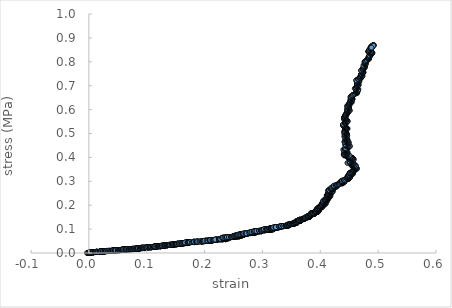
| Category | Series 0 |
|---|---|
| 0.0019377319927558773 | 0 |
| 0.00030210475268787967 | 0 |
| -6.822983028480434e-05 | 0 |
| 0.0001169546046643579 | 0 |
| -0.00012671629123928212 | 0.001 |
| -0.00018520609639395647 | 0.001 |
| 0.0019377319927558773 | 0.001 |
| 0.0013344189403491273 | 0.001 |
| 0.0001169546046643579 | 0 |
| -0.0022638152880408856 | 0 |
| -0.003114068732701402 | 0 |
| -0.00018520609639395647 | 0 |
| -6.822983028480434e-05 | 0 |
| 5.847901212951098e-05 | 0 |
| 0.00017542673968493476 | 0 |
| -6.822983028480434e-05 | 0.001 |
| 0.0001169546046643579 | 0.001 |
| 0.0 | 0.001 |
| 0.0001169546046643579 | 0.001 |
| -0.00024369932280604752 | 0.001 |
| 0.0 | 0.001 |
| 0.002005824639454027 | 0.001 |
| 0.0018209900785496095 | 0.001 |
| 0.0001169546046643579 | 0.001 |
| -0.00031194578324798323 | 0.001 |
| -6.822983028480434e-05 | 0.001 |
| 0.0016945040349432884 | 0.001 |
| 0.0013344189403491273 | 0.001 |
| 0.0001169546046643579 | 0.001 |
| 0.0012078720990073603 | 0.001 |
| 0.0021809000402655725 | 0.001 |
| 0.0003605660629025889 | 0.001 |
| 0.0006041182656574216 | 0.001 |
| 0.0022489768963809944 | 0.001 |
| 0.0022489768963809944 | 0.001 |
| 0.0022489768963809944 | 0.001 |
| 0.0025504027823414523 | 0.001 |
| 0.0021225449789728 | 0.001 |
| 0.002307324580413086 | 0.002 |
| 0.0021809000402655725 | 0.002 |
| 0.0021225449789728 | 0.002 |
| 0.002307324580413086 | 0.002 |
| 0.0017626140102958454 | 0.002 |
| 0.0022489768963809944 | 0.002 |
| 0.0022489768963809944 | 0.002 |
| 0.0020641865121681195 | 0.002 |
| 0.004910053025065919 | 0.002 |
| 0.00460933766709584 | 0.002 |
| 0.0022489768963809944 | 0.002 |
| 0.002365668860191575 | 0.002 |
| 0.0018209900785496095 | 0.002 |
| 0.0003605660629025889 | 0.002 |
| -6.822983028480434e-05 | 0.002 |
| 0.0022489768963809944 | 0.002 |
| 0.0021809000402655725 | 0.002 |
| 0.0021225449789728 | 0.002 |
| 0.0022489768963809944 | 0.002 |
| 0.0022489768963809944 | 0.002 |
| 0.002365668860191575 | 0.003 |
| 0.0020641865121681195 | 0.003 |
| 0.002307324580413086 | 0.003 |
| 0.004910053025065919 | 0.003 |
| 0.005094317553863721 | 0.003 |
| 0.005278548897983513 | 0.003 |
| 0.005394887890596973 | 0.003 |
| 0.005152499459647585 | 0.003 |
| 0.007457654401913286 | 0.003 |
| 0.007757514574202006 | 0.003 |
| 0.00812496665582125 | 0.003 |
| 0.008057288659157112 | 0.003 |
| 0.00781553869854066 | 0.003 |
| 0.005821348182831189 | 0.003 |
| 0.0055209067816348895 | 0.003 |
| 0.008182969463609826 | 0.003 |
| 0.00781553869854066 | 0.003 |
| 0.007999270956746038 | 0.003 |
| 0.008540598121874556 | 0.004 |
| 0.007641448617315353 | 0.004 |
| 0.008182969463609826 | 0.004 |
| 0.008057288659157112 | 0.004 |
| 0.007999270956746038 | 0.004 |
| 0.008240968907267818 | 0.004 |
| 0.008298972589020032 | 0.004 |
| 0.011011501947230747 | 0.004 |
| 0.010770472782698878 | 0.004 |
| 0.010895813075501927 | 0.004 |
| 0.011136812034900816 | 0.004 |
| 0.011011501947230747 | 0.004 |
| 0.011252473030703189 | 0.004 |
| 0.011194640415058243 | 0.004 |
| 0.010837967411561384 | 0.004 |
| 0.010837967411561384 | 0.004 |
| 0.011194640415058243 | 0.004 |
| 0.013716693389746756 | 0.004 |
| 0.013303200593359689 | 0.004 |
| 0.013476315452377284 | 0.005 |
| 0.013957013559449467 | 0.005 |
| 0.013783989463870397 | 0.005 |
| 0.013601317073666503 | 0.005 |
| 0.013601317073666503 | 0.005 |
| 0.013476315452377284 | 0.005 |
| 0.01389933714764287 | 0.005 |
| 0.01354362014232192 | 0.005 |
| 0.013716693389746756 | 0.005 |
| 0.015340137183956458 | 0.005 |
| 0.01672135795758085 | 0.005 |
| 0.019525875835239365 | 0.005 |
| 0.01970746175411439 | 0.005 |
| 0.02000367540098965 | 0.005 |
| 0.019592774604077292 | 0.005 |
| 0.019764804154667474 | 0.005 |
| 0.022036553078574453 | 0.005 |
| 0.022570336579391406 | 0.005 |
| 0.025368020007410248 | 0.005 |
| 0.025662561902579727 | 0.006 |
| 0.025187459155048383 | 0.006 |
| 0.022808538683586316 | 0.006 |
| 0.021855382136539078 | 0.006 |
| 0.022389262326364158 | 0.006 |
| 0.023760787588286966 | 0.006 |
| 0.025244480713663947 | 0.006 |
| 0.025301499021006757 | 0.006 |
| 0.025301499021006757 | 0.006 |
| 0.02542503874414127 | 0.006 |
| 0.02405579570850097 | 0.006 |
| 0.022389262326364158 | 0.006 |
| 0.025006858218697733 | 0.006 |
| 0.02542503874414127 | 0.006 |
| 0.02542503874414127 | 0.006 |
| 0.023637042080112084 | 0.006 |
| 0.022208162776344773 | 0.006 |
| 0.022513162328480572 | 0.006 |
| 0.02209376208266646 | 0.006 |
| 0.02227488984624007 | 0.007 |
| 0.02119717648942345 | 0.007 |
| 0.0196501235812552 | 0.007 |
| 0.02007054972720237 | 0.007 |
| 0.01994634669664423 | 0.007 |
| 0.019889022219767814 | 0.007 |
| 0.02102540069966509 | 0.007 |
| 0.022036553078574453 | 0.007 |
| 0.02482622465975711 | 0.007 |
| 0.025187459155048383 | 0.007 |
| 0.025482046757593604 | 0.007 |
| 0.025063890076096478 | 0.007 |
| 0.025368020007410248 | 0.007 |
| 0.027911492868786858 | 0.007 |
| 0.02779774281995271 | 0.007 |
| 0.02820528666646375 | 0.007 |
| 0.02779774281995271 | 0.007 |
| 0.027911492868786858 | 0.008 |
| 0.027968359314533016 | 0.008 |
| 0.028385303487669843 | 0.008 |
| 0.030864417036506997 | 0.008 |
| 0.029691862483952416 | 0.008 |
| 0.028034703140979247 | 0.008 |
| 0.028385303487669843 | 0.008 |
| 0.028271607325113992 | 0.008 |
| 0.030930576443423237 | 0.008 |
| 0.03198840590006658 | 0.008 |
| 0.03334683016256716 | 0.008 |
| 0.03329026875892624 | 0.008 |
| 0.032988539063922344 | 0.008 |
| 0.030751009839572966 | 0.008 |
| 0.030278311620742418 | 0.008 |
| 0.030751009839572966 | 0.008 |
| 0.03287536509838387 | 0.008 |
| 0.03334683016256716 | 0.008 |
| 0.03345995078612794 | 0.008 |
| 0.032516905007889806 | 0.008 |
| 0.030637582346084456 | 0.009 |
| 0.03145962733323605 | 0.009 |
| 0.030514684943199748 | 0.009 |
| 0.033167704367367545 | 0.009 |
| 0.03470341901536945 | 0.009 |
| 0.03640596169521909 | 0.009 |
| 0.036932131890693574 | 0.009 |
| 0.03581368910822687 | 0.009 |
| 0.033525931289924704 | 0.009 |
| 0.03428910138334906 | 0.009 |
| 0.03640596169521909 | 0.009 |
| 0.03863088753454702 | 0.009 |
| 0.0394463905247044 | 0.009 |
| 0.03951197723303664 | 0.009 |
| 0.03939017308039009 | 0.009 |
| 0.03933395247549706 | 0.009 |
| 0.04138406617731627 | 0.009 |
| 0.04208519144525494 | 0.01 |
| 0.04248694774368386 | 0.01 |
| 0.04272046049407468 | 0.01 |
| 0.042430900976906986 | 0.01 |
| 0.0449407111295008 | 0.01 |
| 0.04487547952082578 | 0.01 |
| 0.04517364433728862 | 0.01 |
| 0.04429753116022133 | 0.01 |
| 0.042430900976906986 | 0.01 |
| 0.042253387800404066 | 0.01 |
| 0.042318790671181425 | 0.01 |
| 0.04481956646752194 | 0.01 |
| 0.045285435058786155 | 0.01 |
| 0.04505252789234674 | 0.01 |
| 0.045108427921947136 | 0.01 |
| 0.04458654342809737 | 0.01 |
| 0.0426083826480744 | 0.01 |
| 0.04214125759073966 | 0.01 |
| 0.042318790671181425 | 0.01 |
| 0.044530614216708383 | 0.011 |
| 0.044763650287773765 | 0.011 |
| 0.04517364433728862 | 0.011 |
| 0.04522953759707535 | 0.011 |
| 0.045108427921947136 | 0.011 |
| 0.04551828799210822 | 0.011 |
| 0.0449966174098363 | 0.011 |
| 0.04755577509419372 | 0.011 |
| 0.047379169403350165 | 0.011 |
| 0.047379169403350165 | 0.011 |
| 0.047788100033174186 | 0.011 |
| 0.046970078794327685 | 0.011 |
| 0.045285435058786155 | 0.011 |
| 0.046570112633748696 | 0.011 |
| 0.05039573817080518 | 0.011 |
| 0.050571811967985915 | 0.011 |
| 0.05010839291426905 | 0.012 |
| 0.05085901682813334 | 0.012 |
| 0.05004350483422732 | 0.012 |
| 0.050571811967985915 | 0.012 |
| 0.05276547633094999 | 0.012 |
| 0.053227665960162616 | 0.012 |
| 0.05351410916723832 | 0.012 |
| 0.053338552715509586 | 0.012 |
| 0.053689627539812296 | 0.012 |
| 0.054031356438076585 | 0.012 |
| 0.05363420516048034 | 0.012 |
| 0.05628194906584206 | 0.012 |
| 0.054954339061824405 | 0.012 |
| 0.05351410916723832 | 0.012 |
| 0.05328311087482016 | 0.012 |
| 0.05356953820279097 | 0.012 |
| 0.05386512963753685 | 0.012 |
| 0.054382188163314506 | 0.013 |
| 0.05622666293095153 | 0.013 |
| 0.056512255749052845 | 0.013 |
| 0.056051589329244374 | 0.013 |
| 0.05633722489905646 | 0.013 |
| 0.05501891653352087 | 0.013 |
| 0.053458669792962536 | 0.013 |
| 0.05582116926578267 | 0.013 |
| 0.05617138098582543 | 0.013 |
| 0.056456982345814415 | 0.013 |
| 0.05714762971857091 | 0.013 |
| 0.05869294155782194 | 0.013 |
| 0.05708318957200422 | 0.013 |
| 0.055996290456835185 | 0.013 |
| 0.056392497677022 | 0.013 |
| 0.05697271005302187 | 0.013 |
| 0.0588675606059613 | 0.013 |
| 0.058987015427307235 | 0.013 |
| 0.05881241723883024 | 0.013 |
| 0.05892269370588938 | 0.014 |
| 0.05996052060226892 | 0.014 |
| 0.061107307335857154 | 0.014 |
| 0.061446496788218424 | 0.014 |
| 0.06116231709318077 | 0.014 |
| 0.06156565116593823 | 0.014 |
| 0.06202378501319317 | 0.014 |
| 0.0642473382642795 | 0.014 |
| 0.06619232732469377 | 0.014 |
| 0.06635651775994131 | 0.014 |
| 0.06442099736851706 | 0.014 |
| 0.06401881354283481 | 0.014 |
| 0.06413765464082301 | 0.014 |
| 0.06431132560426765 | 0.014 |
| 0.06442099736851706 | 0.014 |
| 0.06442099736851706 | 0.015 |
| 0.06431132560426765 | 0.015 |
| 0.0642473382642795 | 0.015 |
| 0.06271059248688822 | 0.015 |
| 0.061043121855155404 | 0.015 |
| 0.05909727264303708 | 0.015 |
| 0.05927181388364185 | 0.015 |
| 0.06121732382459744 | 0.015 |
| 0.06350670786147739 | 0.015 |
| 0.06413765464082301 | 0.015 |
| 0.0642473382642795 | 0.015 |
| 0.06413765464082301 | 0.015 |
| 0.0642473382642795 | 0.015 |
| 0.06612846741040886 | 0.015 |
| 0.06698566958527677 | 0.015 |
| 0.06982560351857135 | 0.015 |
| 0.06999828953954827 | 0.015 |
| 0.06959834301434895 | 0.016 |
| 0.07011642219219194 | 0.016 |
| 0.06966198173370715 | 0.016 |
| 0.0721588596145381 | 0.016 |
| 0.0726121741912435 | 0.016 |
| 0.07232207339870096 | 0.016 |
| 0.07254871581885226 | 0.016 |
| 0.07232207339870096 | 0.016 |
| 0.07486660878125173 | 0.016 |
| 0.07611382138189929 | 0.016 |
| 0.07774740693946013 | 0.016 |
| 0.07785562217044084 | 0.016 |
| 0.07746780853513706 | 0.016 |
| 0.07549044506316407 | 0.016 |
| 0.0750384265561237 | 0.016 |
| 0.07515596533685696 | 0.016 |
| 0.07689936288655297 | 0.017 |
| 0.07746780853513706 | 0.017 |
| 0.07531870494222404 | 0.017 |
| 0.07436001546314766 | 0.017 |
| 0.07221327192328611 | 0.017 |
| 0.072439939001014 | 0.017 |
| 0.07249432888898265 | 0.017 |
| 0.0749841677577847 | 0.017 |
| 0.07611382138189929 | 0.017 |
| 0.07763017237711584 | 0.017 |
| 0.07611382138189929 | 0.017 |
| 0.0750384265561237 | 0.017 |
| 0.07521021481471923 | 0.017 |
| 0.07583383684635597 | 0.017 |
| 0.07780151601876761 | 0.017 |
| 0.07909911471521187 | 0.017 |
| 0.07949528726171359 | 0.018 |
| 0.07797283030680513 | 0.018 |
| 0.07830629845301866 | 0.018 |
| 0.07972031700442445 | 0.018 |
| 0.0822461063057975 | 0.018 |
| 0.0825782233033967 | 0.018 |
| 0.08504309774693167 | 0.018 |
| 0.08454163491352554 | 0.018 |
| 0.0826948792496813 | 0.018 |
| 0.08448788931930418 | 0.018 |
| 0.0854369228975285 | 0.018 |
| 0.0878322878421698 | 0.018 |
| 0.08789476970753085 | 0.018 |
| 0.08805544951895665 | 0.019 |
| 0.08666210295952233 | 0.019 |
| 0.08504309774693167 | 0.019 |
| 0.08330489589396727 | 0.019 |
| 0.08352907008819703 | 0.019 |
| 0.08532058640736644 | 0.019 |
| 0.08549061751094068 | 0.019 |
| 0.08521317603474327 | 0.019 |
| 0.08336766127164633 | 0.019 |
| 0.08291919022027855 | 0.019 |
| 0.08274872129414235 | 0.019 |
| 0.0843176876207227 | 0.019 |
| 0.08504309774693167 | 0.019 |
| 0.08537428726761694 | 0.019 |
| 0.08476553206516718 | 0.019 |
| 0.0829730201890576 | 0.019 |
| 0.08291919022027855 | 0.019 |
| 0.08247051795238348 | 0.019 |
| 0.0830268472603275 | 0.019 |
| 0.08336766127164633 | 0.02 |
| 0.08537428726761694 | 0.02 |
| 0.08521317603474327 | 0.02 |
| 0.08515946652175141 | 0.02 |
| 0.08767157216628463 | 0.02 |
| 0.08834101539416819 | 0.02 |
| 0.09062261141455928 | 0.02 |
| 0.09217928195448871 | 0.02 |
| 0.0929523090437248 | 0.02 |
| 0.09556010327657845 | 0.02 |
| 0.09549809853939678 | 0.02 |
| 0.0956664080704955 | 0.02 |
| 0.09738327370013465 | 0.021 |
| 0.09809927093652604 | 0.021 |
| 0.09837316069809626 | 0.021 |
| 0.09782530613880241 | 0.021 |
| 0.09571955622998808 | 0.021 |
| 0.09478023577688645 | 0.021 |
| 0.09289901360252929 | 0.021 |
| 0.09334303223961135 | 0.021 |
| 0.09267693032989066 | 0.021 |
| 0.09312104756513888 | 0.021 |
| 0.09334303223961135 | 0.021 |
| 0.09278354204481659 | 0.021 |
| 0.09117435518344211 | 0.021 |
| 0.09122774261792112 | 0.021 |
| 0.09312104756513888 | 0.021 |
| 0.09201038443265848 | 0.021 |
| 0.09050687668249648 | 0.021 |
| 0.09089855634744624 | 0.022 |
| 0.09089855634744624 | 0.022 |
| 0.09089855634744624 | 0.022 |
| 0.09178810370068922 | 0.022 |
| 0.09284571532077876 | 0.022 |
| 0.09322761194499961 | 0.022 |
| 0.09367148473463378 | 0.022 |
| 0.09561325708612553 | 0.022 |
| 0.09583468927826279 | 0.022 |
| 0.09561325708612553 | 0.022 |
| 0.09798439833640239 | 0.022 |
| 0.09793137041607795 | 0.022 |
| 0.09832015338957115 | 0.022 |
| 0.09959141516815744 | 0.023 |
| 0.10019121429817732 | 0.023 |
| 0.10052622934266806 | 0.023 |
| 0.10030583368963647 | 0.023 |
| 0.10035873584980763 | 0.023 |
| 0.10047333604275678 | 0.023 |
| 0.10030583368963647 | 0.023 |
| 0.10047333604275678 | 0.023 |
| 0.10057911984502611 | 0.023 |
| 0.10041163521148848 | 0.023 |
| 0.1023403763041828 | 0.023 |
| 0.10288576351044133 | 0.023 |
| 0.10332537088273527 | 0.023 |
| 0.10250753824152231 | 0.023 |
| 0.10052622934266806 | 0.023 |
| 0.10079945528184055 | 0.024 |
| 0.10030583368963647 | 0.024 |
| 0.10272744923552674 | 0.024 |
| 0.10338689220127394 | 0.024 |
| 0.10563445483090304 | 0.024 |
| 0.10601149949068259 | 0.024 |
| 0.10563445483090304 | 0.024 |
| 0.10601149949068259 | 0.024 |
| 0.10623057243112885 | 0.024 |
| 0.10826191344482194 | 0.024 |
| 0.10858550295417088 | 0.024 |
| 0.1084193540239672 | 0.024 |
| 0.10858550295417088 | 0.025 |
| 0.10853303423381971 | 0.025 |
| 0.10848056276035747 | 0.025 |
| 0.10869916427882023 | 0.025 |
| 0.10804321631130767 | 0.025 |
| 0.10639708539302435 | 0.025 |
| 0.10601149949068259 | 0.025 |
| 0.10836687658504127 | 0.025 |
| 0.10820069132331059 | 0.025 |
| 0.10820069132331059 | 0.025 |
| 0.11071671891205473 | 0.025 |
| 0.11109185255095075 | 0.025 |
| 0.11098717505836816 | 0.025 |
| 0.11103951517433164 | 0.025 |
| 0.11082142471765502 | 0.026 |
| 0.11348751995783123 | 0.026 |
| 0.11430504049626661 | 0.026 |
| 0.11636339011382153 | 0.026 |
| 0.11479180159207329 | 0.026 |
| 0.11360062550756497 | 0.026 |
| 0.11375715945228408 | 0.026 |
| 0.11360062550756497 | 0.026 |
| 0.11375715945228408 | 0.026 |
| 0.115278325866786 | 0.026 |
| 0.11599029742810553 | 0.026 |
| 0.11425287102396335 | 0.026 |
| 0.11387023451012987 | 0.026 |
| 0.11387023451012987 | 0.026 |
| 0.11403548032083023 | 0.027 |
| 0.11375715945228408 | 0.027 |
| 0.11604237634084338 | 0.027 |
| 0.11592954664534023 | 0.027 |
| 0.11636339011382153 | 0.027 |
| 0.11484394295696063 | 0.027 |
| 0.11360062550756497 | 0.027 |
| 0.11408766113522865 | 0.027 |
| 0.11392242394767652 | 0.027 |
| 0.11620726363331384 | 0.027 |
| 0.11473965750832185 | 0.027 |
| 0.11365282901738366 | 0.027 |
| 0.11392242394767652 | 0.027 |
| 0.1139746106616283 | 0.027 |
| 0.1139746106616283 | 0.027 |
| 0.11625933124820724 | 0.028 |
| 0.11874647689457955 | 0.028 |
| 0.1190753339769507 | 0.028 |
| 0.1190753339769507 | 0.028 |
| 0.11912725247607817 | 0.028 |
| 0.12042427172403097 | 0.028 |
| 0.12160735210311821 | 0.028 |
| 0.12387465235024431 | 0.028 |
| 0.12402965412894439 | 0.028 |
| 0.12424488324502757 | 0.029 |
| 0.12419322977373506 | 0.029 |
| 0.12397798953883743 | 0.029 |
| 0.12241833188918609 | 0.029 |
| 0.12193526986493432 | 0.029 |
| 0.12419322977373506 | 0.029 |
| 0.124460066047506 | 0.029 |
| 0.12408991482621805 | 0.029 |
| 0.12225446563271382 | 0.029 |
| 0.12155556221083083 | 0.029 |
| 0.12171954302462851 | 0.029 |
| 0.12322865451994444 | 0.029 |
| 0.12419322977373506 | 0.029 |
| 0.12424488324502757 | 0.029 |
| 0.12457193739435579 | 0.029 |
| 0.126557752182563 | 0.03 |
| 0.12532033451973204 | 0.03 |
| 0.12419322977373506 | 0.03 |
| 0.12607675367445065 | 0.03 |
| 0.12639456289066067 | 0.03 |
| 0.126557752182563 | 0.03 |
| 0.1274162187464833 | 0.03 |
| 0.1291308767719235 | 0.03 |
| 0.1291308767719235 | 0.03 |
| 0.12929362017336138 | 0.03 |
| 0.12923367224990234 | 0.03 |
| 0.12837676516015553 | 0.03 |
| 0.12634302034137979 | 0.03 |
| 0.1267724379238817 | 0.031 |
| 0.1264461027834443 | 0.031 |
| 0.12923367224990234 | 0.031 |
| 0.13003849324694222 | 0.031 |
| 0.1314837664709281 | 0.031 |
| 0.1316375933896048 | 0.031 |
| 0.13110766787798028 | 0.031 |
| 0.12934501086925201 | 0.031 |
| 0.13008984567852327 | 0.031 |
| 0.1314837664709281 | 0.031 |
| 0.1336691265083911 | 0.031 |
| 0.1336691265083911 | 0.032 |
| 0.13158632037919216 | 0.032 |
| 0.1317486646959858 | 0.032 |
| 0.13115896543559244 | 0.032 |
| 0.12977314155274836 | 0.032 |
| 0.1291822758317768 | 0.032 |
| 0.13137266573642312 | 0.032 |
| 0.13179992938340535 | 0.032 |
| 0.1313213791402243 | 0.032 |
| 0.1316375933896048 | 0.032 |
| 0.13142394970244187 | 0.032 |
| 0.1316375933896048 | 0.032 |
| 0.1323892509002585 | 0.032 |
| 0.1338822911168324 | 0.033 |
| 0.13595182832090666 | 0.033 |
| 0.136011374866619 | 0.033 |
| 0.1361645069447402 | 0.033 |
| 0.136011374866619 | 0.033 |
| 0.1360624214981963 | 0.033 |
| 0.13611346552414824 | 0.033 |
| 0.1360624214981963 | 0.033 |
| 0.13611346552414824 | 0.033 |
| 0.1371762349040561 | 0.033 |
| 0.1385009246027981 | 0.033 |
| 0.13887425337288947 | 0.033 |
| 0.13892515407686787 | 0.034 |
| 0.1412043558619829 | 0.034 |
| 0.14062020795728924 | 0.034 |
| 0.1386112362419656 | 0.034 |
| 0.13892515407686787 | 0.034 |
| 0.13871306183616355 | 0.034 |
| 0.1412043558619829 | 0.034 |
| 0.14205034571718417 | 0.034 |
| 0.1438920681760256 | 0.034 |
| 0.14210108501638177 | 0.034 |
| 0.14094201752996943 | 0.034 |
| 0.13876397074535726 | 0.034 |
| 0.14019676374290063 | 0.035 |
| 0.14109432991924575 | 0.035 |
| 0.14357970592117253 | 0.035 |
| 0.14384141967103 | 0.035 |
| 0.14395114379396204 | 0.035 |
| 0.14468518247565168 | 0.035 |
| 0.14594942706047345 | 0.035 |
| 0.1446345741258004 | 0.035 |
| 0.14384141967103 | 0.035 |
| 0.1459999689131953 | 0.035 |
| 0.1471616608850204 | 0.035 |
| 0.14852361190313013 | 0.036 |
| 0.14721214150786538 | 0.036 |
| 0.14621052143684315 | 0.036 |
| 0.1462610500954278 | 0.036 |
| 0.14742243898695936 | 0.036 |
| 0.14863282350547505 | 0.036 |
| 0.14700179979443914 | 0.036 |
| 0.1459999689131953 | 0.036 |
| 0.14610945645959314 | 0.036 |
| 0.14721214150786538 | 0.036 |
| 0.14863282350547505 | 0.036 |
| 0.15041215692078053 | 0.036 |
| 0.15088166004498124 | 0.037 |
| 0.1511414699805148 | 0.037 |
| 0.15135094283943978 | 0.037 |
| 0.15083136432691274 | 0.037 |
| 0.15109118732840474 | 0.037 |
| 0.15088166004498124 | 0.037 |
| 0.1532843358898512 | 0.037 |
| 0.15349336040398018 | 0.037 |
| 0.1531338032892465 | 0.037 |
| 0.1519790982715526 | 0.037 |
| 0.15078106607905759 | 0.037 |
| 0.1511414699805148 | 0.037 |
| 0.15140957947186903 | 0.038 |
| 0.15318398334060837 | 0.038 |
| 0.15171950589729008 | 0.038 |
| 0.15078106607905759 | 0.038 |
| 0.1510409021478222 | 0.038 |
| 0.1512001188966534 | 0.038 |
| 0.15083136432691274 | 0.038 |
| 0.1526570000720541 | 0.038 |
| 0.15302508216818708 | 0.038 |
| 0.15334285926745858 | 0.038 |
| 0.153551871550403 | 0.038 |
| 0.15307526767534008 | 0.038 |
| 0.15360203062798894 | 0.039 |
| 0.15318398334060837 | 0.039 |
| 0.15578968545583508 | 0.039 |
| 0.15578968545583508 | 0.039 |
| 0.15578968545583508 | 0.039 |
| 0.15589810643749363 | 0.039 |
| 0.15589810643749363 | 0.039 |
| 0.15844684095732497 | 0.039 |
| 0.15953601269302561 | 0.039 |
| 0.1608314302795973 | 0.04 |
| 0.16098909594062386 | 0.04 |
| 0.16052431548488696 | 0.04 |
| 0.15875459434012745 | 0.04 |
| 0.15902067070116574 | 0.04 |
| 0.16078163252341665 | 0.04 |
| 0.16326829222429048 | 0.04 |
| 0.16357456558714797 | 0.04 |
| 0.16119651632568885 | 0.04 |
| 0.1599015065731444 | 0.04 |
| 0.15844684095732497 | 0.04 |
| 0.16036657652112962 | 0.04 |
| 0.16103888336692077 | 0.04 |
| 0.1637814504411716 | 0.041 |
| 0.16398829250270539 | 0.041 |
| 0.1637814504411716 | 0.041 |
| 0.16393865170719982 | 0.041 |
| 0.16388900844736337 | 0.041 |
| 0.16616161232919482 | 0.041 |
| 0.16719293868834498 | 0.041 |
| 0.1686267221123183 | 0.042 |
| 0.1705352411275244 | 0.042 |
| 0.17047771533510847 | 0.042 |
| 0.168939580612054 | 0.042 |
| 0.16878316359724121 | 0.042 |
| 0.1686267221123183 | 0.042 |
| 0.17022288152357923 | 0.042 |
| 0.1706831770962728 | 0.042 |
| 0.17104468471294967 | 0.042 |
| 0.16955672292371138 | 0.042 |
| 0.16616161232919482 | 0.042 |
| 0.1680666085980942 | 0.042 |
| 0.1686267221123183 | 0.043 |
| 0.1706831770962728 | 0.043 |
| 0.17104468471294967 | 0.043 |
| 0.1708392972219797 | 0.043 |
| 0.1708392972219797 | 0.043 |
| 0.17063386753832216 | 0.043 |
| 0.17088859665157313 | 0.043 |
| 0.1720709253489193 | 0.043 |
| 0.17330110288913664 | 0.043 |
| 0.17360431929571843 | 0.043 |
| 0.17314536665803823 | 0.043 |
| 0.1691947416202279 | 0.043 |
| 0.1688901850010091 | 0.044 |
| 0.1686267221123183 | 0.044 |
| 0.1705845555488195 | 0.044 |
| 0.17063386753832216 | 0.044 |
| 0.17099539297799737 | 0.044 |
| 0.17047771533510847 | 0.044 |
| 0.16857731104463727 | 0.044 |
| 0.16724235335797516 | 0.044 |
| 0.16636796270930118 | 0.044 |
| 0.1705845555488195 | 0.044 |
| 0.17140606168909558 | 0.044 |
| 0.17339945690321013 | 0.045 |
| 0.1735059854296106 | 0.045 |
| 0.17309617836320484 | 0.045 |
| 0.1734568148702377 | 0.045 |
| 0.17478344336192883 | 0.045 |
| 0.17814952085578573 | 0.045 |
| 0.18191873409071044 | 0.045 |
| 0.182828416412326 | 0.046 |
| 0.18338842833439506 | 0.046 |
| 0.183128694305684 | 0.046 |
| 0.18303135643881854 | 0.046 |
| 0.18434535198612445 | 0.046 |
| 0.18515557182367395 | 0.046 |
| 0.18566570848430464 | 0.046 |
| 0.18490451528746246 | 0.046 |
| 0.18298265203499567 | 0.046 |
| 0.18323419147074504 | 0.046 |
| 0.182828416412326 | 0.047 |
| 0.18100010047896534 | 0.046 |
| 0.18247114446049428 | 0.047 |
| 0.18521232314313338 | 0.047 |
| 0.18232494224481346 | 0.047 |
| 0.18084555874925642 | 0.047 |
| 0.18110582243192677 | 0.047 |
| 0.1819674903383332 | 0.047 |
| 0.18521232314313338 | 0.047 |
| 0.1868792852689518 | 0.047 |
| 0.18778446827533601 | 0.048 |
| 0.1879378779290555 | 0.048 |
| 0.1879378779290555 | 0.048 |
| 0.18778446827533601 | 0.048 |
| 0.1912600395232701 | 0.048 |
| 0.19282050617062158 | 0.048 |
| 0.19542929244860807 | 0.048 |
| 0.1952769647889963 | 0.049 |
| 0.1952769647889963 | 0.049 |
| 0.1952769647889963 | 0.049 |
| 0.19512461392213368 | 0.049 |
| 0.19752742487976224 | 0.049 |
| 0.19792734314024094 | 0.049 |
| 0.1975754260328057 | 0.049 |
| 0.1993257989083984 | 0.049 |
| 0.1997249359814914 | 0.049 |
| 0.19812724231098572 | 0.049 |
| 0.19837506431394422 | 0.05 |
| 0.20181408430172218 | 0.05 |
| 0.20514610895987434 | 0.05 |
| 0.20593971868361477 | 0.05 |
| 0.2024591040858002 | 0.05 |
| 0.20276155646234142 | 0.05 |
| 0.20643138323933805 | 0.051 |
| 0.20638380531574751 | 0.051 |
| 0.2060824466799784 | 0.051 |
| 0.20667715606643028 | 0.051 |
| 0.20559061049237776 | 0.051 |
| 0.20161492084396834 | 0.051 |
| 0.20201320810129142 | 0.051 |
| 0.20191762861488138 | 0.051 |
| 0.20395451221749641 | 0.051 |
| 0.20404989722703312 | 0.051 |
| 0.2041532103050326 | 0.051 |
| 0.2016627261976194 | 0.051 |
| 0.2000202463452561 | 0.051 |
| 0.20370813176914235 | 0.052 |
| 0.2056382261686033 | 0.052 |
| 0.2112721066418245 | 0.052 |
| 0.21319553657057772 | 0.052 |
| 0.21354200034772633 | 0.052 |
| 0.21186373859391827 | 0.052 |
| 0.21078275484379946 | 0.053 |
| 0.2087597462296859 | 0.052 |
| 0.21157190561372188 | 0.053 |
| 0.2133924071221381 | 0.053 |
| 0.2117217714016219 | 0.053 |
| 0.21073544559165291 | 0.053 |
| 0.2089574919109106 | 0.053 |
| 0.21034061786691044 | 0.053 |
| 0.21122475847870253 | 0.053 |
| 0.21334515924736258 | 0.054 |
| 0.21398278633550444 | 0.054 |
| 0.21358923892331313 | 0.054 |
| 0.21122475847870253 | 0.054 |
| 0.2088072112478054 | 0.054 |
| 0.20909985205513687 | 0.054 |
| 0.20940030287663844 | 0.054 |
| 0.2112721066418245 | 0.054 |
| 0.21161923734330623 | 0.054 |
| 0.2111300554263822 | 0.054 |
| 0.20920264474863823 | 0.054 |
| 0.2098429178476005 | 0.054 |
| 0.21354200034772633 | 0.055 |
| 0.21525676029452734 | 0.055 |
| 0.21634076213379225 | 0.055 |
| 0.21991424336674587 | 0.055 |
| 0.22083692252457066 | 0.055 |
| 0.22050078587731084 | 0.055 |
| 0.22118074938105622 | 0.056 |
| 0.22030530993042166 | 0.056 |
| 0.21878718049485085 | 0.056 |
| 0.21937438425421305 | 0.056 |
| 0.22303065210061607 | 0.056 |
| 0.22050078587731084 | 0.056 |
| 0.2184973613168887 | 0.056 |
| 0.22488491330635013 | 0.057 |
| 0.22595076790107751 | 0.057 |
| 0.22745806910654467 | 0.057 |
| 0.2301175513262317 | 0.057 |
| 0.2318118668501338 | 0.057 |
| 0.2306516432251965 | 0.057 |
| 0.23099211259486838 | 0.057 |
| 0.2362468410448931 | 0.058 |
| 0.23620066077229238 | 0.058 |
| 0.23629301918497456 | 0.058 |
| 0.23859903042924444 | 0.058 |
| 0.2362468410448931 | 0.058 |
| 0.22760557308731333 | 0.058 |
| 0.23026466357277547 | 0.058 |
| 0.231765481309623 | 0.058 |
| 0.2303653036480002 | 0.058 |
| 0.2303653036480002 | 0.058 |
| 0.23195873007144 | 0.059 |
| 0.22900961748371243 | 0.059 |
| 0.22532072882943738 | 0.058 |
| 0.22561634610364104 | 0.059 |
| 0.22633942022425152 | 0.059 |
| 0.23002462076581592 | 0.059 |
| 0.23094568901314058 | 0.059 |
| 0.23166498205685349 | 0.059 |
| 0.22668136069235637 | 0.059 |
| 0.2272639485527971 | 0.059 |
| 0.23441354780095375 | 0.06 |
| 0.23556935692729333 | 0.06 |
| 0.23620066077229238 | 0.06 |
| 0.2364853950673449 | 0.06 |
| 0.23556935692729333 | 0.06 |
| 0.23205148107602538 | 0.06 |
| 0.2330710533170287 | 0.06 |
| 0.23446751084052908 | 0.061 |
| 0.23479892555427165 | 0.061 |
| 0.23533058425403663 | 0.061 |
| 0.23859903042924444 | 0.061 |
| 0.2363391951927342 | 0.061 |
| 0.23446751084052908 | 0.061 |
| 0.23620066077229238 | 0.061 |
| 0.2367777307089771 | 0.061 |
| 0.23855295865623716 | 0.061 |
| 0.24128268312351195 | 0.062 |
| 0.242950567294762 | 0.062 |
| 0.2377310390805157 | 0.062 |
| 0.2364853950673449 | 0.062 |
| 0.2363391951927342 | 0.062 |
| 0.23658541106212175 | 0.062 |
| 0.23620066077229238 | 0.062 |
| 0.2384531392640362 | 0.062 |
| 0.23759269735756475 | 0.062 |
| 0.23210557172710775 | 0.062 |
| 0.23479892555427165 | 0.062 |
| 0.2362468410448931 | 0.063 |
| 0.23667773394835318 | 0.063 |
| 0.23667773394835318 | 0.063 |
| 0.23849921563602358 | 0.063 |
| 0.23883702405356352 | 0.063 |
| 0.2384531392640362 | 0.063 |
| 0.23893680513588342 | 0.063 |
| 0.23864510007974138 | 0.064 |
| 0.23859903042924444 | 0.064 |
| 0.23874490031332543 | 0.064 |
| 0.23849921563602358 | 0.064 |
| 0.23316370121464947 | 0.064 |
| 0.23297068519423664 | 0.064 |
| 0.23629301918497456 | 0.064 |
| 0.23682388434063337 | 0.064 |
| 0.23620066077229238 | 0.064 |
| 0.235091815147928 | 0.064 |
| 0.23369622977523152 | 0.064 |
| 0.2301175513262317 | 0.064 |
| 0.231912351342917 | 0.064 |
| 0.23446751084052908 | 0.065 |
| 0.2397960314802372 | 0.065 |
| 0.24113718298308487 | 0.065 |
| 0.24109122800167274 | 0.065 |
| 0.2384531392640362 | 0.065 |
| 0.23643922581017435 | 0.065 |
| 0.240371030957225 | 0.066 |
| 0.24152003898753893 | 0.066 |
| 0.24324101930613146 | 0.066 |
| 0.24572168923868132 | 0.066 |
| 0.2476713600708034 | 0.066 |
| 0.24070820775770202 | 0.066 |
| 0.2384531392640362 | 0.066 |
| 0.23869116760792305 | 0.066 |
| 0.24204807709751888 | 0.066 |
| 0.2456225829013674 | 0.067 |
| 0.2512712893941463 | 0.067 |
| 0.2511348083550949 | 0.067 |
| 0.2458588510739754 | 0.067 |
| 0.24805172305581738 | 0.067 |
| 0.2499513111633467 | 0.068 |
| 0.25027763467233577 | 0.068 |
| 0.251225797784106 | 0.068 |
| 0.2584475959644711 | 0.069 |
| 0.25482052200660193 | 0.069 |
| 0.2501410776296865 | 0.068 |
| 0.25027763467233577 | 0.068 |
| 0.24999686078747632 | 0.069 |
| 0.24805172305581738 | 0.068 |
| 0.2513243503874723 | 0.069 |
| 0.2540194807885404 | 0.069 |
| 0.2542991870933953 | 0.069 |
| 0.25453341436748944 | 0.069 |
| 0.25628502064945696 | 0.07 |
| 0.25764939683546406 | 0.07 |
| 0.2585379224640487 | 0.07 |
| 0.2605153647109982 | 0.07 |
| 0.2604702917005408 | 0.07 |
| 0.2564207413222846 | 0.07 |
| 0.25802598412749356 | 0.07 |
| 0.2607481997300115 | 0.071 |
| 0.2592450993325793 | 0.071 |
| 0.25816152794842906 | 0.071 |
| 0.2562322222293632 | 0.071 |
| 0.2537321430391783 | 0.071 |
| 0.2500423486429429 | 0.07 |
| 0.25033080809154695 | 0.071 |
| 0.25023215751851025 | 0.071 |
| 0.25023215751851025 | 0.071 |
| 0.2526500800948117 | 0.071 |
| 0.25599833323158755 | 0.071 |
| 0.25335393495812525 | 0.071 |
| 0.25278635449868586 | 0.072 |
| 0.2584024296549196 | 0.072 |
| 0.2585379224640487 | 0.072 |
| 0.2585905992902523 | 0.072 |
| 0.2643987152255002 | 0.073 |
| 0.2641218199943237 | 0.073 |
| 0.25877873352443514 | 0.073 |
| 0.2607481997300115 | 0.073 |
| 0.2629011549508411 | 0.073 |
| 0.26173145069094045 | 0.073 |
| 0.2607031372131442 | 0.073 |
| 0.26089081541349624 | 0.073 |
| 0.257739795459097 | 0.073 |
| 0.2521730627341263 | 0.073 |
| 0.2588238828413107 | 0.073 |
| 0.26028247546721306 | 0.074 |
| 0.2566621220019592 | 0.074 |
| 0.2571294757398796 | 0.074 |
| 0.2584475959644711 | 0.074 |
| 0.2552434871864685 | 0.074 |
| 0.25416311870803265 | 0.074 |
| 0.2561416872142317 | 0.074 |
| 0.2569862633008757 | 0.074 |
| 0.2584927602341194 | 0.075 |
| 0.26379244730326495 | 0.075 |
| 0.2643538169138426 | 0.075 |
| 0.25660934348899295 | 0.075 |
| 0.25868085369380384 | 0.075 |
| 0.2629011549508411 | 0.075 |
| 0.26622271749206405 | 0.076 |
| 0.26757361117868594 | 0.076 |
| 0.26752885519163416 | 0.076 |
| 0.26510181985273 | 0.076 |
| 0.26079326021633986 | 0.076 |
| 0.2644510842347328 | 0.076 |
| 0.26468300478739243 | 0.076 |
| 0.25905705282556274 | 0.076 |
| 0.26201649943225264 | 0.076 |
| 0.2673871831284327 | 0.077 |
| 0.2629985636640598 | 0.077 |
| 0.2607031372131442 | 0.077 |
| 0.2607481997300115 | 0.077 |
| 0.2611686066168469 | 0.077 |
| 0.2607481997300115 | 0.077 |
| 0.2627662520802612 | 0.077 |
| 0.2623389690379522 | 0.077 |
| 0.25872600743000357 | 0.077 |
| 0.26107857647498983 | 0.078 |
| 0.2652886744061719 | 0.078 |
| 0.2656623963394228 | 0.078 |
| 0.2654755528313076 | 0.078 |
| 0.2696226145127204 | 0.079 |
| 0.2671558889555394 | 0.079 |
| 0.2629536024425166 | 0.078 |
| 0.267856999709775 | 0.079 |
| 0.2698086848456773 | 0.079 |
| 0.26995007280634165 | 0.079 |
| 0.2714817616782793 | 0.08 |
| 0.2738934388464477 | 0.08 |
| 0.2677600631256651 | 0.08 |
| 0.2656623963394228 | 0.08 |
| 0.26748409720139404 | 0.08 |
| 0.26748409720139404 | 0.08 |
| 0.2673871831284327 | 0.08 |
| 0.2691535683449964 | 0.08 |
| 0.2692057475057583 | 0.08 |
| 0.2655652467740056 | 0.08 |
| 0.26705888438101977 | 0.08 |
| 0.2696226145127204 | 0.081 |
| 0.26831921047133345 | 0.081 |
| 0.2679464803147961 | 0.081 |
| 0.27393791089115593 | 0.081 |
| 0.27180113550033846 | 0.081 |
| 0.26743188679155344 | 0.081 |
| 0.2707385175319771 | 0.082 |
| 0.27217243194235397 | 0.082 |
| 0.274167583637642 | 0.082 |
| 0.275692831112027 | 0.082 |
| 0.2786477283244208 | 0.083 |
| 0.27449355726241664 | 0.083 |
| 0.2726845924079209 | 0.083 |
| 0.2804901294386682 | 0.083 |
| 0.28141008756688984 | 0.083 |
| 0.2810422058681244 | 0.084 |
| 0.28585797379923 | 0.084 |
| 0.2865900115534814 | 0.084 |
| 0.2794293478334794 | 0.084 |
| 0.281226163634625 | 0.084 |
| 0.28503006519593554 | 0.085 |
| 0.2823732986252729 | 0.084 |
| 0.28159397767736244 | 0.084 |
| 0.28868810080549806 | 0.085 |
| 0.286538789227627 | 0.085 |
| 0.28099804865326944 | 0.085 |
| 0.28127031077792863 | 0.085 |
| 0.2807625298667794 | 0.085 |
| 0.2770310005827727 | 0.085 |
| 0.27993780598828577 | 0.085 |
| 0.2848907935162664 | 0.086 |
| 0.2807625298667794 | 0.086 |
| 0.2795251598653008 | 0.086 |
| 0.28695585833922665 | 0.086 |
| 0.28608498297392093 | 0.086 |
| 0.2832914689994513 | 0.086 |
| 0.28622408844764624 | 0.087 |
| 0.2868168546285358 | 0.087 |
| 0.28154249879609927 | 0.086 |
| 0.28301242144376787 | 0.087 |
| 0.2870875373267556 | 0.087 |
| 0.284619515463162 | 0.087 |
| 0.28365852431704164 | 0.087 |
| 0.2889582775317182 | 0.088 |
| 0.28576276663877326 | 0.088 |
| 0.2787878721449255 | 0.087 |
| 0.28232920014996044 | 0.088 |
| 0.28319601716385234 | 0.088 |
| 0.2832474109963613 | 0.088 |
| 0.28507404473053016 | 0.088 |
| 0.2889582775317182 | 0.089 |
| 0.2841647795049885 | 0.088 |
| 0.2813144559723481 | 0.088 |
| 0.28480281639164556 | 0.089 |
| 0.28590191693865763 | 0.089 |
| 0.2872703864636421 | 0.089 |
| 0.29164865093937076 | 0.09 |
| 0.2932419364892682 | 0.09 |
| 0.29342366385727237 | 0.09 |
| 0.2950068782804996 | 0.09 |
| 0.2978619720026064 | 0.091 |
| 0.29826712198148597 | 0.091 |
| 0.2978185513065032 | 0.091 |
| 0.29794880773915144 | 0.091 |
| 0.2959135840832915 | 0.091 |
| 0.2914666006871 | 0.091 |
| 0.2928784398396616 | 0.091 |
| 0.2932419364892682 | 0.091 |
| 0.2918306680553796 | 0.091 |
| 0.2916049596107555 | 0.092 |
| 0.29151029806108664 | 0.092 |
| 0.287182618449057 | 0.091 |
| 0.2853085503789753 | 0.091 |
| 0.28740932715039713 | 0.092 |
| 0.28982671265734694 | 0.092 |
| 0.295688795411922 | 0.093 |
| 0.29840454324887183 | 0.093 |
| 0.2994887465744281 | 0.093 |
| 0.29401223607638693 | 0.093 |
| 0.29460046208200585 | 0.093 |
| 0.2978185513065032 | 0.094 |
| 0.29822371887409543 | 0.094 |
| 0.29812968182689986 | 0.094 |
| 0.3039002765904657 | 0.095 |
| 0.302460760910255 | 0.095 |
| 0.2978185513065032 | 0.094 |
| 0.29953209481158904 | 0.095 |
| 0.2998932381345986 | 0.095 |
| 0.3020068706376722 | 0.095 |
| 0.3042598460972357 | 0.095 |
| 0.310574177112789 | 0.096 |
| 0.3070814635593186 | 0.096 |
| 0.30439644635562024 | 0.096 |
| 0.30819933553443446 | 0.096 |
| 0.30980939362766136 | 0.097 |
| 0.3127081584473743 | 0.097 |
| 0.31555583146758104 | 0.098 |
| 0.3164867231952317 | 0.098 |
| 0.31123837713639296 | 0.097 |
| 0.31119553339814054 | 0.098 |
| 0.3126225949926287 | 0.098 |
| 0.31409028871424666 | 0.098 |
| 0.31484470106722556 | 0.098 |
| 0.318657743587414 | 0.099 |
| 0.31790620344262277 | 0.099 |
| 0.3145814294115204 | 0.099 |
| 0.31466682543282276 | 0.099 |
| 0.31426826692092386 | 0.099 |
| 0.31110984041448475 | 0.099 |
| 0.31177374098425537 | 0.099 |
| 0.31448891815304963 | 0.099 |
| 0.30954479279924135 | 0.099 |
| 0.3061418275541213 | 0.099 |
| 0.304482716540551 | 0.099 |
| 0.3049785974723749 | 0.099 |
| 0.306235114208077 | 0.099 |
| 0.3078913227495813 | 0.1 |
| 0.307977291970062 | 0.1 |
| 0.30290725451577905 | 0.099 |
| 0.30286405234236874 | 0.1 |
| 0.3061848883553867 | 0.1 |
| 0.3076190569010355 | 0.1 |
| 0.308557306523574 | 0.101 |
| 0.3124871138948944 | 0.101 |
| 0.31226602047091734 | 0.101 |
| 0.310574177112789 | 0.101 |
| 0.3124015315239133 | 0.102 |
| 0.31252990233391337 | 0.102 |
| 0.31284355354266263 | 0.102 |
| 0.31493712347596575 | 0.102 |
| 0.32091593231488474 | 0.103 |
| 0.3166642195906165 | 0.103 |
| 0.3126225949926287 | 0.103 |
| 0.31448891815304963 | 0.103 |
| 0.31484470106722556 | 0.103 |
| 0.3170192853749031 | 0.103 |
| 0.31839547401766755 | 0.104 |
| 0.3186152165529913 | 0.104 |
| 0.3153354714724901 | 0.104 |
| 0.3154705113333586 | 0.104 |
| 0.3170192853749031 | 0.104 |
| 0.3182182289151325 | 0.104 |
| 0.31914664668395626 | 0.105 |
| 0.3262053054265849 | 0.106 |
| 0.32589576258348085 | 0.106 |
| 0.3210503319447958 | 0.105 |
| 0.32263984789888484 | 0.106 |
| 0.3228586598430489 | 0.106 |
| 0.32483983003758454 | 0.106 |
| 0.32593798112875516 | 0.106 |
| 0.32900784929662125 | 0.107 |
| 0.32325375443810594 | 0.107 |
| 0.3189695346848909 | 0.106 |
| 0.3210926999492857 | 0.107 |
| 0.32056235890744095 | 0.107 |
| 0.3188845053240787 | 0.107 |
| 0.32272455855763454 | 0.107 |
| 0.32474820759179396 | 0.108 |
| 0.32329608467023363 | 0.108 |
| 0.32321142241405365 | 0.108 |
| 0.32479756510352276 | 0.108 |
| 0.32431141763690274 | 0.108 |
| 0.32311970612847013 | 0.108 |
| 0.33063384704988485 | 0.109 |
| 0.33128486047778016 | 0.109 |
| 0.32923233154057724 | 0.109 |
| 0.33071788325951795 | 0.11 |
| 0.3315017891472898 | 0.11 |
| 0.32975809561837965 | 0.11 |
| 0.33067586603746196 | 0.11 |
| 0.33398952473183835 | 0.111 |
| 0.3317256572943431 | 0.111 |
| 0.3290990823114303 | 0.11 |
| 0.3312008719032591 | 0.111 |
| 0.3318515714199207 | 0.111 |
| 0.33398952473183835 | 0.111 |
| 0.3355168078296123 | 0.112 |
| 0.336081126223594 | 0.112 |
| 0.33220123138769225 | 0.112 |
| 0.3325088288579005 | 0.112 |
| 0.3362134484024411 | 0.113 |
| 0.3363457530744457 | 0.113 |
| 0.3362552335985546 | 0.113 |
| 0.33973092124881565 | 0.113 |
| 0.3402928672114957 | 0.114 |
| 0.3402096318405823 | 0.114 |
| 0.3414642453941141 | 0.114 |
| 0.3422398299327384 | 0.114 |
| 0.3423713397362326 | 0.115 |
| 0.34275880118404073 | 0.115 |
| 0.3441415541196542 | 0.115 |
| 0.3444455011718649 | 0.115 |
| 0.34401027692604175 | 0.115 |
| 0.34431426387612296 | 0.116 |
| 0.3448735865666393 | 0.116 |
| 0.346301673590277 | 0.116 |
| 0.34668766966209447 | 0.116 |
| 0.34612930676755205 | 0.116 |
| 0.3447493015683273 | 0.116 |
| 0.34461815844622 | 0.117 |
| 0.34418300935489277 | 0.117 |
| 0.3446595939288308 | 0.117 |
| 0.3441000971658081 | 0.117 |
| 0.346301673590277 | 0.117 |
| 0.3458672566217377 | 0.118 |
| 0.34431426387612296 | 0.118 |
| 0.34302172145507887 | 0.118 |
| 0.34228827719526256 | 0.118 |
| 0.34431426387612296 | 0.118 |
| 0.3447010276946136 | 0.118 |
| 0.3462534203808465 | 0.119 |
| 0.3457844839655235 | 0.119 |
| 0.34401027692604175 | 0.119 |
| 0.3460396686152385 | 0.119 |
| 0.346556726312087 | 0.119 |
| 0.3481475343322018 | 0.12 |
| 0.3483195536601526 | 0.12 |
| 0.34818882383420013 | 0.12 |
| 0.3485327646083605 | 0.12 |
| 0.3484502663980516 | 0.121 |
| 0.3501685557112459 | 0.121 |
| 0.3514518993809224 | 0.121 |
| 0.3523979430505702 | 0.121 |
| 0.3527404932946667 | 0.122 |
| 0.3523979430505702 | 0.122 |
| 0.35256923284020214 | 0.122 |
| 0.35261028630442526 | 0.122 |
| 0.35248017012180516 | 0.122 |
| 0.3542325954435146 | 0.123 |
| 0.35466334053969406 | 0.123 |
| 0.3565826048603419 | 0.123 |
| 0.355517559726119 | 0.124 |
| 0.3542325954435146 | 0.124 |
| 0.3528226383415888 | 0.123 |
| 0.3529528176868456 | 0.124 |
| 0.3543625376022261 | 0.124 |
| 0.3548752570999815 | 0.124 |
| 0.3542325954435146 | 0.124 |
| 0.35449246287816666 | 0.125 |
| 0.3541026363976443 | 0.125 |
| 0.35261028630442526 | 0.125 |
| 0.35354839957668727 | 0.125 |
| 0.3544035712908634 | 0.125 |
| 0.35653479154540846 | 0.126 |
| 0.3569236712436052 | 0.126 |
| 0.3581984340721669 | 0.126 |
| 0.3596416029785874 | 0.127 |
| 0.3600700784332883 | 0.127 |
| 0.35879770079310713 | 0.127 |
| 0.35815755580883485 | 0.127 |
| 0.35828698898225575 | 0.127 |
| 0.358627528202992 | 0.128 |
| 0.3581984340721669 | 0.128 |
| 0.3583278619550348 | 0.128 |
| 0.35875010036469424 | 0.128 |
| 0.3601992643153759 | 0.128 |
| 0.359471520442671 | 0.129 |
| 0.3581984340721669 | 0.129 |
| 0.35704645241592897 | 0.129 |
| 0.3566644885721022 | 0.129 |
| 0.3582393106645347 | 0.129 |
| 0.35951914004828167 | 0.129 |
| 0.36028085242857855 | 0.13 |
| 0.3603691696718721 | 0.13 |
| 0.360151677086774 | 0.13 |
| 0.35836867969179337 | 0.13 |
| 0.35760556244231956 | 0.13 |
| 0.3566235475543398 | 0.13 |
| 0.3579872206535108 | 0.131 |
| 0.3582393106645347 | 0.131 |
| 0.3583278619550348 | 0.131 |
| 0.3586683872595749 | 0.131 |
| 0.3581984340721669 | 0.131 |
| 0.3584095493258352 | 0.131 |
| 0.358627528202992 | 0.132 |
| 0.3601992643153759 | 0.132 |
| 0.3601992643153759 | 0.132 |
| 0.36024005920405483 | 0.133 |
| 0.3617278013684173 | 0.133 |
| 0.3619789502960064 | 0.133 |
| 0.3621486069322493 | 0.133 |
| 0.3633353448343743 | 0.134 |
| 0.3639722381678013 | 0.134 |
| 0.3645612950399502 | 0.134 |
| 0.3639248301505322 | 0.134 |
| 0.36405351904365973 | 0.135 |
| 0.36561675666983884 | 0.135 |
| 0.36612373971271617 | 0.135 |
| 0.3663805888585689 | 0.136 |
| 0.3663805888585689 | 0.136 |
| 0.3662521991045114 | 0.136 |
| 0.36587368288514904 | 0.136 |
| 0.3639722381678013 | 0.136 |
| 0.3642634551912493 | 0.136 |
| 0.36405351904365973 | 0.136 |
| 0.36401287943155325 | 0.137 |
| 0.36431084715807494 | 0.137 |
| 0.36401287943155325 | 0.137 |
| 0.36269804560930585 | 0.137 |
| 0.3623589433287926 | 0.137 |
| 0.3622300361636488 | 0.137 |
| 0.3630777655409605 | 0.138 |
| 0.36405351904365973 | 0.138 |
| 0.3643514746629386 | 0.138 |
| 0.36431084715807494 | 0.138 |
| 0.3643514746629386 | 0.139 |
| 0.36418219137808694 | 0.139 |
| 0.36405351904365973 | 0.139 |
| 0.36578579730138255 | 0.139 |
| 0.3665494473025673 | 0.14 |
| 0.36844605557494614 | 0.14 |
| 0.36873591983201276 | 0.14 |
| 0.3683178777137495 | 0.141 |
| 0.36844605557494614 | 0.141 |
| 0.36878310031821493 | 0.141 |
| 0.3704197327237191 | 0.142 |
| 0.3705879634719284 | 0.142 |
| 0.37029858270663824 | 0.142 |
| 0.3705879634719284 | 0.142 |
| 0.3703389676765011 | 0.142 |
| 0.37050726493049374 | 0.143 |
| 0.3714690323079846 | 0.143 |
| 0.3723089688595609 | 0.143 |
| 0.37243658338611274 | 0.143 |
| 0.37243658338611274 | 0.144 |
| 0.3724768821068556 | 0.144 |
| 0.37256418162927485 | 0.144 |
| 0.3723089688595609 | 0.144 |
| 0.37264476716402484 | 0.145 |
| 0.3724768821068556 | 0.145 |
| 0.37239628304131733 | 0.145 |
| 0.37239628304131733 | 0.145 |
| 0.372355981072339 | 0.145 |
| 0.3724768821068556 | 0.146 |
| 0.37239628304131733 | 0.146 |
| 0.3724768821068556 | 0.146 |
| 0.37243658338611274 | 0.146 |
| 0.372355981072339 | 0.146 |
| 0.37252388642650835 | 0.147 |
| 0.3726044752084034 | 0.147 |
| 0.3739063564597555 | 0.147 |
| 0.3753672316740462 | 0.148 |
| 0.3761236551302438 | 0.148 |
| 0.37649825950479504 | 0.148 |
| 0.3761638055432737 | 0.149 |
| 0.3742013384927219 | 0.148 |
| 0.3748246592141448 | 0.149 |
| 0.3762039017257068 | 0.149 |
| 0.3780021034465023 | 0.15 |
| 0.378376057442441 | 0.15 |
| 0.38004372959804567 | 0.15 |
| 0.38008372292970033 | 0.151 |
| 0.38000373466686055 | 0.151 |
| 0.3802969762216202 | 0.151 |
| 0.3802503358629021 | 0.151 |
| 0.3818749676986751 | 0.152 |
| 0.381914887861494 | 0.152 |
| 0.38183504594217327 | 0.152 |
| 0.3809165101356922 | 0.152 |
| 0.37996373813601697 | 0.152 |
| 0.3784628435079924 | 0.152 |
| 0.37883662528021855 | 0.153 |
| 0.38000373466686055 | 0.153 |
| 0.3802503358629021 | 0.153 |
| 0.38004372959804567 | 0.154 |
| 0.378376057442441 | 0.154 |
| 0.3783359957558392 | 0.154 |
| 0.37812904607393616 | 0.154 |
| 0.3795837699471615 | 0.154 |
| 0.37996373813601697 | 0.155 |
| 0.3801703609265645 | 0.155 |
| 0.3803369594265832 | 0.155 |
| 0.38004372959804567 | 0.155 |
| 0.3805435051234569 | 0.156 |
| 0.38008372292970033 | 0.156 |
| 0.3818749676986751 | 0.156 |
| 0.3819548064307571 | 0.157 |
| 0.3818749676986751 | 0.157 |
| 0.38216766112344663 | 0.157 |
| 0.381914887861494 | 0.157 |
| 0.3819548064307571 | 0.158 |
| 0.38295220086384013 | 0.158 |
| 0.3837825514298056 | 0.158 |
| 0.38420080907357546 | 0.159 |
| 0.3836165260200159 | 0.159 |
| 0.3838223955156729 | 0.159 |
| 0.3835766737304589 | 0.159 |
| 0.381914887861494 | 0.159 |
| 0.38208119600345086 | 0.159 |
| 0.38200136736191725 | 0.16 |
| 0.3836563767214314 | 0.16 |
| 0.3840746871310301 | 0.161 |
| 0.3838223955156729 | 0.161 |
| 0.3840746871310301 | 0.161 |
| 0.3840746871310301 | 0.161 |
| 0.38569317480665594 | 0.162 |
| 0.3861900834418145 | 0.162 |
| 0.38573294283967235 | 0.162 |
| 0.38709723214619474 | 0.163 |
| 0.3875537496437828 | 0.163 |
| 0.3895363718592455 | 0.164 |
| 0.38969482441565256 | 0.164 |
| 0.3894901604545223 | 0.164 |
| 0.3883803416454579 | 0.164 |
| 0.3875934437556555 | 0.164 |
| 0.38779849623487944 | 0.165 |
| 0.38713694438290097 | 0.165 |
| 0.38569317480665594 | 0.165 |
| 0.3860642121568115 | 0.165 |
| 0.3857726571737431 | 0.165 |
| 0.3857726571737431 | 0.165 |
| 0.3852755410209935 | 0.166 |
| 0.3838223955156729 | 0.166 |
| 0.3840746871310301 | 0.166 |
| 0.3840746871310301 | 0.166 |
| 0.38573294283967235 | 0.167 |
| 0.386600722114153 | 0.167 |
| 0.3875537496437828 | 0.168 |
| 0.3882547457666675 | 0.168 |
| 0.38779849623487944 | 0.168 |
| 0.3895759873522107 | 0.169 |
| 0.39031515404267103 | 0.169 |
| 0.39171932105691915 | 0.169 |
| 0.39171932105691915 | 0.17 |
| 0.39171932105691915 | 0.17 |
| 0.3918379037007295 | 0.17 |
| 0.39254247840596335 | 0.171 |
| 0.3935687795561538 | 0.171 |
| 0.3954542071749714 | 0.172 |
| 0.3956182789760289 | 0.172 |
| 0.3957823238619466 | 0.172 |
| 0.3956576542671718 | 0.173 |
| 0.3955789021344114 | 0.173 |
| 0.395906977916151 | 0.173 |
| 0.3956182789760289 | 0.173 |
| 0.39574295347949595 | 0.174 |
| 0.3957823238619466 | 0.174 |
| 0.3955789021344114 | 0.174 |
| 0.3934438336767954 | 0.174 |
| 0.3916732104216431 | 0.174 |
| 0.3918379037007295 | 0.174 |
| 0.3923779011342721 | 0.175 |
| 0.3936082356280929 | 0.175 |
| 0.39266096348354307 | 0.175 |
| 0.3916336779257841 | 0.175 |
| 0.3918379037007295 | 0.176 |
| 0.39258197499170083 | 0.176 |
| 0.3936476901433119 | 0.176 |
| 0.3938515050608393 | 0.177 |
| 0.39393695846889387 | 0.177 |
| 0.3956182789760289 | 0.178 |
| 0.3956182789760289 | 0.178 |
| 0.3955789021344114 | 0.178 |
| 0.39607097545320213 | 0.179 |
| 0.3956182789760289 | 0.179 |
| 0.3977880063199839 | 0.179 |
| 0.3981546353590663 | 0.18 |
| 0.39787312401610475 | 0.18 |
| 0.396890508411717 | 0.18 |
| 0.395493588926892 | 0.18 |
| 0.39553952374219714 | 0.18 |
| 0.3963529945072429 | 0.181 |
| 0.39782729627177427 | 0.181 |
| 0.39840328584215445 | 0.182 |
| 0.397912410623833 | 0.182 |
| 0.39594634184155336 | 0.182 |
| 0.39607097545320213 | 0.182 |
| 0.39553952374219714 | 0.182 |
| 0.39602506504410767 | 0.183 |
| 0.3955789021344114 | 0.183 |
| 0.3958216926944313 | 0.183 |
| 0.39574295347949595 | 0.184 |
| 0.3955789021344114 | 0.184 |
| 0.3947188824042645 | 0.184 |
| 0.39377261055583157 | 0.184 |
| 0.3954148238720671 | 0.185 |
| 0.3956576542671718 | 0.185 |
| 0.3955789021344114 | 0.185 |
| 0.39611033292367437 | 0.186 |
| 0.3955789021344114 | 0.186 |
| 0.3955789021344114 | 0.186 |
| 0.3964775258871845 | 0.187 |
| 0.39787312401610475 | 0.187 |
| 0.3983640185148946 | 0.188 |
| 0.39787312401610475 | 0.188 |
| 0.39799097920928 | 0.188 |
| 0.3974605471790191 | 0.188 |
| 0.3956182789760289 | 0.188 |
| 0.3973819369055844 | 0.189 |
| 0.39787312401610475 | 0.189 |
| 0.3980367994531762 | 0.19 |
| 0.39840328584215445 | 0.19 |
| 0.39954784510262914 | 0.191 |
| 0.40007717141057736 | 0.191 |
| 0.3997504611426383 | 0.191 |
| 0.4015851394291196 | 0.192 |
| 0.40170907227819286 | 0.192 |
| 0.4015851394291196 | 0.192 |
| 0.4017482084761419 | 0.193 |
| 0.40170907227819286 | 0.193 |
| 0.40354016394482833 | 0.194 |
| 0.4035792285477796 | 0.194 |
| 0.4034555272702322 | 0.194 |
| 0.4038265852063186 | 0.195 |
| 0.40354016394482833 | 0.195 |
| 0.40361829162474727 | 0.195 |
| 0.40341645783454616 | 0.196 |
| 0.40170907227819286 | 0.196 |
| 0.40284980503604323 | 0.196 |
| 0.4033383143836138 | 0.196 |
| 0.40178734314250886 | 0.196 |
| 0.4010957726782351 | 0.197 |
| 0.39966550309800986 | 0.197 |
| 0.4008085680725482 | 0.197 |
| 0.40150685273592446 | 0.198 |
| 0.40150685273592446 | 0.198 |
| 0.40182647627741364 | 0.199 |
| 0.40146119121879154 | 0.199 |
| 0.4019112509359855 | 0.199 |
| 0.40150685273592446 | 0.199 |
| 0.401872121118503 | 0.2 |
| 0.401872121118503 | 0.2 |
| 0.4034555272702322 | 0.201 |
| 0.4036638547538016 | 0.201 |
| 0.4035010978157742 | 0.201 |
| 0.40370291452521373 | 0.202 |
| 0.4035792285477796 | 0.202 |
| 0.4034555272702322 | 0.202 |
| 0.40593308587039134 | 0.203 |
| 0.40727664019016246 | 0.204 |
| 0.4073544765039025 | 0.204 |
| 0.4073544765039025 | 0.205 |
| 0.40528342672697804 | 0.204 |
| 0.40690686045487795 | 0.205 |
| 0.40727664019016246 | 0.205 |
| 0.4091364228187032 | 0.206 |
| 0.4088903762641502 | 0.207 |
| 0.4072312413776549 | 0.206 |
| 0.4077176155540173 | 0.207 |
| 0.40711447024473396 | 0.207 |
| 0.40406738178199875 | 0.207 |
| 0.40415196668929254 | 0.207 |
| 0.40512093319358466 | 0.208 |
| 0.4056927892745811 | 0.208 |
| 0.40528342672697804 | 0.209 |
| 0.40402833624427814 | 0.209 |
| 0.40354016394482833 | 0.209 |
| 0.4035010978157742 | 0.209 |
| 0.4056927892745811 | 0.21 |
| 0.40715339547078244 | 0.211 |
| 0.4054069021115045 | 0.211 |
| 0.40528342672697804 | 0.211 |
| 0.40524442864245386 | 0.211 |
| 0.406705689385457 | 0.212 |
| 0.40727664019016246 | 0.212 |
| 0.407393392388956 | 0.213 |
| 0.40760090120506415 | 0.213 |
| 0.4073155591043439 | 0.214 |
| 0.4077176155540173 | 0.214 |
| 0.4073155591043439 | 0.214 |
| 0.40747769644512505 | 0.215 |
| 0.4079638998223139 | 0.215 |
| 0.411154295348729 | 0.216 |
| 0.41022991497076394 | 0.216 |
| 0.40917526942083304 | 0.216 |
| 0.4078796367468255 | 0.216 |
| 0.40706906406913934 | 0.217 |
| 0.40524442864245386 | 0.217 |
| 0.40674463052633575 | 0.217 |
| 0.4073155591043439 | 0.218 |
| 0.407393392388956 | 0.218 |
| 0.40743878384076404 | 0.219 |
| 0.40727664019016246 | 0.219 |
| 0.40642009169224774 | 0.219 |
| 0.40524442864245386 | 0.219 |
| 0.4087737987209428 | 0.22 |
| 0.4090522584898636 | 0.221 |
| 0.407393392388956 | 0.221 |
| 0.40868960386527 | 0.221 |
| 0.40921411451396333 | 0.222 |
| 0.4078018413004809 | 0.222 |
| 0.40848879114873865 | 0.223 |
| 0.4127682336978776 | 0.224 |
| 0.4124069244311542 | 0.224 |
| 0.411154295348729 | 0.224 |
| 0.4112769971885189 | 0.225 |
| 0.41099275307548616 | 0.225 |
| 0.40942124589700957 | 0.225 |
| 0.411154295348729 | 0.226 |
| 0.41280693947510533 | 0.227 |
| 0.4115160066106663 | 0.227 |
| 0.41131576072715303 | 0.227 |
| 0.4111930636439204 | 0.227 |
| 0.41147725083364445 | 0.228 |
| 0.41123828295428083 | 0.228 |
| 0.41280693947510533 | 0.229 |
| 0.41301332808326807 | 0.229 |
| 0.41292948943351515 | 0.23 |
| 0.41305202437527283 | 0.23 |
| 0.4128907883994799 | 0.23 |
| 0.41373532761063647 | 0.231 |
| 0.41405750140992054 | 0.232 |
| 0.4155831482464074 | 0.232 |
| 0.41474016880864234 | 0.233 |
| 0.41365154947303723 | 0.233 |
| 0.4138964274847731 | 0.233 |
| 0.4137739959745602 | 0.233 |
| 0.41292948943351515 | 0.234 |
| 0.4137739959745602 | 0.234 |
| 0.4137739959745602 | 0.235 |
| 0.41341304998194345 | 0.235 |
| 0.41285208586761685 | 0.235 |
| 0.41123828295428083 | 0.235 |
| 0.4124069244311542 | 0.236 |
| 0.4128907883994799 | 0.237 |
| 0.41670817251299397 | 0.238 |
| 0.41722849524403866 | 0.239 |
| 0.4155831482464074 | 0.238 |
| 0.4155445497775479 | 0.239 |
| 0.4155445497775479 | 0.239 |
| 0.41417989821717854 | 0.239 |
| 0.41425719907784 | 0.24 |
| 0.4173119742595812 | 0.241 |
| 0.41686884473357244 | 0.241 |
| 0.4155059498187888 | 0.241 |
| 0.41369665775141246 | 0.241 |
| 0.4127682336978776 | 0.241 |
| 0.41123828295428083 | 0.242 |
| 0.41236820316763645 | 0.242 |
| 0.41365154947303723 | 0.243 |
| 0.4137739959745602 | 0.243 |
| 0.41385776385487727 | 0.244 |
| 0.41369665775141246 | 0.244 |
| 0.41373532761063647 | 0.245 |
| 0.41301332808326807 | 0.245 |
| 0.41530650139269754 | 0.246 |
| 0.4154223198955691 | 0.246 |
| 0.41312941246736345 | 0.246 |
| 0.41357425246766977 | 0.247 |
| 0.41365154947303723 | 0.247 |
| 0.41397375026022515 | 0.248 |
| 0.4138126628432995 | 0.248 |
| 0.41373532761063647 | 0.249 |
| 0.4138964274847731 | 0.249 |
| 0.41369665775141246 | 0.25 |
| 0.41385776385487727 | 0.25 |
| 0.41417989821717854 | 0.25 |
| 0.4155445497775479 | 0.251 |
| 0.4173119742595812 | 0.252 |
| 0.4191147428553451 | 0.253 |
| 0.41943518847809247 | 0.254 |
| 0.41875577021705307 | 0.254 |
| 0.41570535847313766 | 0.254 |
| 0.41643188730556113 | 0.254 |
| 0.41743397340149674 | 0.255 |
| 0.42019743427881007 | 0.256 |
| 0.42103582780655996 | 0.257 |
| 0.42107421490544056 | 0.257 |
| 0.41971709369465926 | 0.257 |
| 0.4173890333961439 | 0.257 |
| 0.4175495457798877 | 0.258 |
| 0.4173890333961439 | 0.258 |
| 0.4173890333961439 | 0.258 |
| 0.418992999020707 | 0.259 |
| 0.42103582780655996 | 0.26 |
| 0.4170294406290532 | 0.26 |
| 0.4156667647212084 | 0.26 |
| 0.4138964274847731 | 0.26 |
| 0.41486248209321225 | 0.261 |
| 0.4155059498187888 | 0.261 |
| 0.4157439507356467 | 0.262 |
| 0.41538371521836215 | 0.262 |
| 0.4138126628432995 | 0.262 |
| 0.41486248209321225 | 0.263 |
| 0.4155831482464074 | 0.263 |
| 0.4186723612154691 | 0.265 |
| 0.4195120841814545 | 0.266 |
| 0.4209974392340533 | 0.266 |
| 0.42055588986469045 | 0.267 |
| 0.4191532037685645 | 0.267 |
| 0.4222314749171229 | 0.268 |
| 0.42283190165409007 | 0.269 |
| 0.4212341369077111 | 0.269 |
| 0.42183521286330206 | 0.269 |
| 0.42279363219308513 | 0.27 |
| 0.41859540091141456 | 0.269 |
| 0.4177934712321888 | 0.27 |
| 0.4190762804628268 | 0.271 |
| 0.41967225617800324 | 0.271 |
| 0.4190762804628268 | 0.272 |
| 0.4221931322172529 | 0.273 |
| 0.42283190165409007 | 0.274 |
| 0.41943518847809247 | 0.273 |
| 0.4207158947733924 | 0.274 |
| 0.42279363219308513 | 0.275 |
| 0.42450363043670536 | 0.276 |
| 0.4253002492868104 | 0.277 |
| 0.4284802939197717 | 0.278 |
| 0.42733029701217473 | 0.278 |
| 0.42470761928926404 | 0.278 |
| 0.42633803382682417 | 0.279 |
| 0.4263762179319167 | 0.28 |
| 0.4247841106477327 | 0.28 |
| 0.42561871922329547 | 0.28 |
| 0.4263762179319167 | 0.281 |
| 0.42418480512324647 | 0.281 |
| 0.4233873470324514 | 0.281 |
| 0.4263762179319167 | 0.283 |
| 0.42720949933134345 | 0.283 |
| 0.4285564972558769 | 0.284 |
| 0.4303454564779773 | 0.285 |
| 0.430579952065713 | 0.286 |
| 0.42863903599576597 | 0.286 |
| 0.43054192814258074 | 0.287 |
| 0.43247915794210695 | 0.288 |
| 0.432675210882798 | 0.289 |
| 0.4332315293121306 | 0.289 |
| 0.43807347212799996 | 0.291 |
| 0.4371295928380433 | 0.291 |
| 0.4347282236884785 | 0.291 |
| 0.4372492476925952 | 0.293 |
| 0.43830616272447015 | 0.293 |
| 0.43830616272447015 | 0.294 |
| 0.43980155762205425 | 0.295 |
| 0.4416018776411044 | 0.296 |
| 0.4392928515513723 | 0.296 |
| 0.4384633033391895 | 0.296 |
| 0.4397576116793094 | 0.297 |
| 0.4392928515513723 | 0.297 |
| 0.43823069876324783 | 0.298 |
| 0.439682257174847 | 0.299 |
| 0.4394059251992642 | 0.299 |
| 0.4350436560675304 | 0.298 |
| 0.4354347195479099 | 0.299 |
| 0.43630458974584113 | 0.3 |
| 0.43669516052808643 | 0.3 |
| 0.43709181714884354 | 0.301 |
| 0.4415266619875381 | 0.303 |
| 0.44038526291233393 | 0.303 |
| 0.43823069876324783 | 0.303 |
| 0.4409373097695266 | 0.305 |
| 0.44175855053796254 | 0.305 |
| 0.44168334666817055 | 0.306 |
| 0.4437930184400275 | 0.307 |
| 0.4469148865212106 | 0.309 |
| 0.44726394255025653 | 0.309 |
| 0.4472265477668833 | 0.31 |
| 0.4490508898429637 | 0.311 |
| 0.4487024571102583 | 0.311 |
| 0.4469896980009739 | 0.311 |
| 0.4501761913550976 | 0.313 |
| 0.4503750104562924 | 0.314 |
| 0.4454300989887429 | 0.313 |
| 0.44702710164217613 | 0.314 |
| 0.4490508898429637 | 0.315 |
| 0.4504868379916751 | 0.316 |
| 0.45091536998411147 | 0.317 |
| 0.45099608380291045 | 0.317 |
| 0.4497908515455293 | 0.317 |
| 0.4470707292856384 | 0.317 |
| 0.44839125558057846 | 0.318 |
| 0.4490508898429637 | 0.319 |
| 0.4490882164689236 | 0.319 |
| 0.45002083184131303 | 0.32 |
| 0.4507228610050144 | 0.321 |
| 0.4496727369631005 | 0.321 |
| 0.44893268782275564 | 0.322 |
| 0.44733872792215507 | 0.322 |
| 0.4478869015254918 | 0.323 |
| 0.4490508898429637 | 0.323 |
| 0.4506855953461133 | 0.325 |
| 0.4507228610050144 | 0.325 |
| 0.4493618372864736 | 0.325 |
| 0.4504868379916751 | 0.326 |
| 0.45250364356071376 | 0.327 |
| 0.4539346458232355 | 0.329 |
| 0.4544792165978576 | 0.329 |
| 0.45602482571132996 | 0.331 |
| 0.4551348485440658 | 0.331 |
| 0.452658569108768 | 0.331 |
| 0.4540151163220663 | 0.332 |
| 0.4545534643347589 | 0.332 |
| 0.45602482571132996 | 0.333 |
| 0.4556726428493739 | 0.334 |
| 0.45420699261530717 | 0.334 |
| 0.4520013598661809 | 0.334 |
| 0.4507601252752379 | 0.334 |
| 0.4508781114986275 | 0.335 |
| 0.451653953837029 | 0.336 |
| 0.45258422929079906 | 0.337 |
| 0.4552523197680055 | 0.338 |
| 0.45598158697866875 | 0.339 |
| 0.45439883209909876 | 0.339 |
| 0.4545905861360395 | 0.34 |
| 0.45420699261530717 | 0.34 |
| 0.45563556119500803 | 0.341 |
| 0.4563706682839365 | 0.342 |
| 0.4578701533247737 | 0.343 |
| 0.458067497222028 | 0.344 |
| 0.45798735217350783 | 0.345 |
| 0.4582585491335367 | 0.345 |
| 0.45810448880741617 | 0.346 |
| 0.45975520811110615 | 0.347 |
| 0.45983526000258546 | 0.348 |
| 0.4597182775391977 | 0.348 |
| 0.46017978749887595 | 0.349 |
| 0.45983526000258546 | 0.35 |
| 0.4598721862545969 | 0.35 |
| 0.4613357000281232 | 0.352 |
| 0.4635576050063649 | 0.353 |
| 0.4614893117113788 | 0.353 |
| 0.4597182775391977 | 0.353 |
| 0.4581414790244777 | 0.353 |
| 0.4586036686414364 | 0.354 |
| 0.45964446070979353 | 0.355 |
| 0.4612558164927659 | 0.356 |
| 0.4614893117113788 | 0.357 |
| 0.4601059563461407 | 0.357 |
| 0.45998910232621854 | 0.357 |
| 0.45975520811110615 | 0.358 |
| 0.45891170871253045 | 0.358 |
| 0.45837565400651276 | 0.359 |
| 0.4612558164927659 | 0.36 |
| 0.46094849776598 | 0.361 |
| 0.4580243467236524 | 0.361 |
| 0.45844961301532333 | 0.362 |
| 0.45783320156379015 | 0.362 |
| 0.456333612504956 | 0.362 |
| 0.45783320156379015 | 0.363 |
| 0.46137257091707456 | 0.365 |
| 0.4582215632467507 | 0.365 |
| 0.45621631681309244 | 0.365 |
| 0.4579133589671754 | 0.366 |
| 0.4570991206723912 | 0.366 |
| 0.4542812605662237 | 0.366 |
| 0.4580243467236524 | 0.368 |
| 0.45945362500568415 | 0.369 |
| 0.45482569130874306 | 0.368 |
| 0.45517194876998995 | 0.369 |
| 0.45609895878314255 | 0.37 |
| 0.4551348485440658 | 0.37 |
| 0.45436170317874824 | 0.371 |
| 0.4576050111633497 | 0.373 |
| 0.4572965682518288 | 0.373 |
| 0.45420699261530717 | 0.373 |
| 0.45544395884075556 | 0.374 |
| 0.45609895878314255 | 0.375 |
| 0.4530489939625852 | 0.374 |
| 0.45389749966382903 | 0.375 |
| 0.45606189293420013 | 0.377 |
| 0.45424412728023156 | 0.377 |
| 0.45273919109721605 | 0.377 |
| 0.45273919109721605 | 0.378 |
| 0.451653953837029 | 0.378 |
| 0.447108129896155 | 0.377 |
| 0.4504868379916751 | 0.379 |
| 0.45246644420602794 | 0.38 |
| 0.45107059059580634 | 0.38 |
| 0.4513002279869768 | 0.381 |
| 0.45258422929079906 | 0.382 |
| 0.45172841163208216 | 0.383 |
| 0.45103333789326605 | 0.383 |
| 0.4556726428493739 | 0.386 |
| 0.4561360232582585 | 0.387 |
| 0.4541698565713481 | 0.387 |
| 0.4545905861360395 | 0.387 |
| 0.4541698565713481 | 0.388 |
| 0.4529313123429808 | 0.388 |
| 0.45374271726096926 | 0.389 |
| 0.4579133589671754 | 0.391 |
| 0.4546339337037771 | 0.391 |
| 0.4527763803074656 | 0.391 |
| 0.4557529736177951 | 0.393 |
| 0.4552523197680055 | 0.393 |
| 0.4508408516248969 | 0.392 |
| 0.45420699261530717 | 0.394 |
| 0.4561792553139504 | 0.396 |
| 0.4561792553139504 | 0.397 |
| 0.4558271268448309 | 0.397 |
| 0.45424412728023156 | 0.397 |
| 0.451691183427551 | 0.397 |
| 0.4492437209296934 | 0.397 |
| 0.453513591432463 | 0.399 |
| 0.4531233479623044 | 0.4 |
| 0.4491317542853641 | 0.399 |
| 0.4515732931021113 | 0.4 |
| 0.4524292434674988 | 0.401 |
| 0.4478495300307151 | 0.4 |
| 0.4480052272170955 | 0.401 |
| 0.4506855953461133 | 0.403 |
| 0.4502942464906967 | 0.404 |
| 0.4491690778931057 | 0.404 |
| 0.4508408516248969 | 0.405 |
| 0.45006432907352767 | 0.406 |
| 0.447108129896155 | 0.405 |
| 0.4491690778931057 | 0.407 |
| 0.4504868379916751 | 0.408 |
| 0.4458608029760012 | 0.407 |
| 0.44582335568471576 | 0.407 |
| 0.4469896980009739 | 0.409 |
| 0.4441806267885543 | 0.408 |
| 0.4417209493100193 | 0.408 |
| 0.4447305829730221 | 0.41 |
| 0.44519906036549695 | 0.411 |
| 0.4434802850894843 | 0.411 |
| 0.44402438210414463 | 0.412 |
| 0.443398962331738 | 0.412 |
| 0.44062373126278576 | 0.412 |
| 0.44101256976300174 | 0.413 |
| 0.44500544768739736 | 0.415 |
| 0.44355535394896417 | 0.415 |
| 0.4417209493100193 | 0.415 |
| 0.4434802850894843 | 0.417 |
| 0.4434802850894843 | 0.418 |
| 0.4434427485463881 | 0.418 |
| 0.445935693351936 | 0.42 |
| 0.4469896980009739 | 0.422 |
| 0.4456235803846326 | 0.422 |
| 0.4452365310418119 | 0.422 |
| 0.44508040214621336 | 0.423 |
| 0.44351782022364084 | 0.423 |
| 0.44168334666817055 | 0.423 |
| 0.44461186914872186 | 0.425 |
| 0.44476807120728507 | 0.426 |
| 0.441639483346471 | 0.425 |
| 0.44308610570314055 | 0.427 |
| 0.4434802850894843 | 0.428 |
| 0.44203423326156366 | 0.428 |
| 0.44254154703768417 | 0.429 |
| 0.44500544768739736 | 0.431 |
| 0.44461186914872186 | 0.431 |
| 0.4434802850894843 | 0.432 |
| 0.4436741932550471 | 0.432 |
| 0.4433614227358853 | 0.433 |
| 0.4399585128121634 | 0.432 |
| 0.44285452482893345 | 0.434 |
| 0.44500544768739736 | 0.436 |
| 0.4420718227117122 | 0.435 |
| 0.442384947527757 | 0.436 |
| 0.4434802850894843 | 0.438 |
| 0.4437554936342453 | 0.439 |
| 0.44359913331650297 | 0.439 |
| 0.44839125558057846 | 0.442 |
| 0.4491317542853641 | 0.443 |
| 0.44901356182367486 | 0.444 |
| 0.450256964855472 | 0.445 |
| 0.4506855953461133 | 0.446 |
| 0.447731234899999 | 0.446 |
| 0.4480052272170955 | 0.447 |
| 0.4506048564617026 | 0.449 |
| 0.4478869015254918 | 0.448 |
| 0.4451615882850778 | 0.448 |
| 0.4453177045066781 | 0.449 |
| 0.4450429256190766 | 0.449 |
| 0.44351782022364084 | 0.45 |
| 0.44508040214621336 | 0.451 |
| 0.4468712520780177 | 0.453 |
| 0.44414311652515437 | 0.452 |
| 0.44386806382752286 | 0.453 |
| 0.4450429256190766 | 0.454 |
| 0.4447305829730221 | 0.455 |
| 0.44355535394896417 | 0.455 |
| 0.4480052272170955 | 0.458 |
| 0.44893268782275564 | 0.459 |
| 0.44702710164217613 | 0.459 |
| 0.4473013359353121 | 0.46 |
| 0.44702710164217613 | 0.461 |
| 0.4457422232565969 | 0.461 |
| 0.4458608029760012 | 0.462 |
| 0.44897623241095297 | 0.464 |
| 0.44726394255025653 | 0.464 |
| 0.4451615882850778 | 0.464 |
| 0.4453177045066781 | 0.465 |
| 0.44476807120728507 | 0.465 |
| 0.4417209493100193 | 0.465 |
| 0.443398962331738 | 0.467 |
| 0.44508040214621336 | 0.468 |
| 0.4451615882850778 | 0.469 |
| 0.44519906036549695 | 0.47 |
| 0.44511787726891255 | 0.471 |
| 0.4444181427385573 | 0.471 |
| 0.44351782022364084 | 0.472 |
| 0.44636613062627495 | 0.474 |
| 0.4467964317362833 | 0.475 |
| 0.44519906036549695 | 0.475 |
| 0.4453926355649837 | 0.476 |
| 0.44511787726891255 | 0.476 |
| 0.4439868659793978 | 0.477 |
| 0.44402438210414463 | 0.478 |
| 0.44508040214621336 | 0.479 |
| 0.4444181427385573 | 0.48 |
| 0.4434802850894843 | 0.48 |
| 0.44488676649079045 | 0.481 |
| 0.44488676649079045 | 0.482 |
| 0.44355535394896417 | 0.482 |
| 0.44426188600661043 | 0.484 |
| 0.44508040214621336 | 0.485 |
| 0.44386806382752286 | 0.485 |
| 0.44386806382752286 | 0.486 |
| 0.44351782022364084 | 0.487 |
| 0.44281696478916854 | 0.487 |
| 0.441639483346471 | 0.487 |
| 0.44597931956364045 | 0.49 |
| 0.446559480063508 | 0.492 |
| 0.44363666399002416 | 0.491 |
| 0.4437930184400275 | 0.492 |
| 0.443398962331738 | 0.492 |
| 0.4434802850894843 | 0.493 |
| 0.4437554936342453 | 0.494 |
| 0.4449617298454856 | 0.496 |
| 0.44546756100904655 | 0.497 |
| 0.44511787726891255 | 0.498 |
| 0.4453926355649837 | 0.499 |
| 0.44500544768739736 | 0.499 |
| 0.4417961503521066 | 0.499 |
| 0.4434802850894843 | 0.5 |
| 0.4450429256190766 | 0.502 |
| 0.4439118295072607 | 0.502 |
| 0.4437116719279897 | 0.503 |
| 0.44351782022364084 | 0.504 |
| 0.4429734474453003 | 0.504 |
| 0.441639483346471 | 0.505 |
| 0.44320500078412955 | 0.506 |
| 0.44355535394896417 | 0.507 |
| 0.4417961503521066 | 0.507 |
| 0.44254154703768417 | 0.508 |
| 0.4434802850894843 | 0.51 |
| 0.4423098400051466 | 0.51 |
| 0.4420718227117122 | 0.511 |
| 0.44488676649079045 | 0.513 |
| 0.44461186914872186 | 0.514 |
| 0.4434802850894843 | 0.514 |
| 0.44351782022364084 | 0.515 |
| 0.4436741932550471 | 0.516 |
| 0.44351782022364084 | 0.517 |
| 0.44500544768739736 | 0.519 |
| 0.4469896980009739 | 0.52 |
| 0.4457047715244756 | 0.521 |
| 0.44511787726891255 | 0.521 |
| 0.44511787726891255 | 0.522 |
| 0.44461186914872186 | 0.523 |
| 0.4434802850894843 | 0.523 |
| 0.4434427485463881 | 0.524 |
| 0.44355535394896417 | 0.525 |
| 0.4434802850894843 | 0.526 |
| 0.4439493484471382 | 0.527 |
| 0.4434427485463881 | 0.527 |
| 0.4423098400051466 | 0.528 |
| 0.44184000680255986 | 0.528 |
| 0.441639483346471 | 0.529 |
| 0.44222837274728005 | 0.53 |
| 0.44168334666817055 | 0.531 |
| 0.4405044795251126 | 0.531 |
| 0.44011544337120706 | 0.532 |
| 0.4399145737665727 | 0.533 |
| 0.44062373126278576 | 0.534 |
| 0.44156427052149555 | 0.535 |
| 0.4401531050154946 | 0.535 |
| 0.4400338465031783 | 0.536 |
| 0.43987690313756517 | 0.537 |
| 0.43987690313756517 | 0.538 |
| 0.43983923108942813 | 0.538 |
| 0.4427731511646405 | 0.541 |
| 0.4437116719279897 | 0.542 |
| 0.4434802850894843 | 0.543 |
| 0.4437116719279897 | 0.544 |
| 0.4434802850894843 | 0.545 |
| 0.4436741932550471 | 0.546 |
| 0.4437930184400275 | 0.547 |
| 0.4467590194660301 | 0.549 |
| 0.4466405462153714 | 0.55 |
| 0.4451615882850778 | 0.55 |
| 0.44695229296068706 | 0.552 |
| 0.4467964317362833 | 0.553 |
| 0.4437116719279897 | 0.552 |
| 0.44445564268726323 | 0.554 |
| 0.44508040214621336 | 0.555 |
| 0.44410560485468176 | 0.555 |
| 0.44363666399002416 | 0.556 |
| 0.4434427485463881 | 0.557 |
| 0.4429734474453003 | 0.557 |
| 0.441639483346471 | 0.558 |
| 0.44308610570314055 | 0.559 |
| 0.443398962331738 | 0.56 |
| 0.44175855053796254 | 0.56 |
| 0.4420718227117122 | 0.561 |
| 0.4417209493100193 | 0.562 |
| 0.44191519889226905 | 0.563 |
| 0.4419527928170361 | 0.564 |
| 0.443398962331738 | 0.566 |
| 0.4432863393162521 | 0.567 |
| 0.441639483346471 | 0.567 |
| 0.4418776035541458 | 0.568 |
| 0.4419527928170361 | 0.569 |
| 0.4417961503521066 | 0.569 |
| 0.4425039752404002 | 0.571 |
| 0.4434802850894843 | 0.572 |
| 0.4434802850894843 | 0.573 |
| 0.44351782022364084 | 0.574 |
| 0.4434802850894843 | 0.575 |
| 0.44351782022364084 | 0.576 |
| 0.44351782022364084 | 0.577 |
| 0.4450429256190766 | 0.579 |
| 0.4453177045066781 | 0.58 |
| 0.44511787726891255 | 0.581 |
| 0.4452365310418119 | 0.582 |
| 0.44508040214621336 | 0.582 |
| 0.4451615882850778 | 0.583 |
| 0.44519906036549695 | 0.584 |
| 0.4467964317362833 | 0.586 |
| 0.4474944556551189 | 0.587 |
| 0.44702710164217613 | 0.588 |
| 0.44733872792215507 | 0.589 |
| 0.4472265477668833 | 0.59 |
| 0.4470707292856384 | 0.591 |
| 0.4478495300307151 | 0.592 |
| 0.4491317542853641 | 0.594 |
| 0.4506421251294567 | 0.596 |
| 0.4505303149590745 | 0.597 |
| 0.4473823419725115 | 0.596 |
| 0.44702710164217613 | 0.597 |
| 0.44702710164217613 | 0.597 |
| 0.44839125558057846 | 0.599 |
| 0.4490508898429637 | 0.601 |
| 0.4470707292856384 | 0.6 |
| 0.44741968192890563 | 0.601 |
| 0.4470707292856384 | 0.602 |
| 0.44882068634572597 | 0.604 |
| 0.4491317542853641 | 0.605 |
| 0.4490882164689236 | 0.606 |
| 0.44951729920711314 | 0.607 |
| 0.44901356182367486 | 0.608 |
| 0.4480052272170955 | 0.609 |
| 0.44718292692103284 | 0.609 |
| 0.4470707292856384 | 0.61 |
| 0.4481173200588803 | 0.611 |
| 0.4491317542853641 | 0.613 |
| 0.4491690778931057 | 0.614 |
| 0.4490508898429637 | 0.615 |
| 0.44726394255025653 | 0.615 |
| 0.4472265477668833 | 0.616 |
| 0.4469896980009739 | 0.616 |
| 0.4485842138949858 | 0.618 |
| 0.44944272549182906 | 0.62 |
| 0.4507973393204676 | 0.622 |
| 0.4504868379916751 | 0.622 |
| 0.4491317542853641 | 0.622 |
| 0.4501016178910871 | 0.624 |
| 0.4507973393204676 | 0.625 |
| 0.4507601252752379 | 0.626 |
| 0.4523858489832041 | 0.628 |
| 0.4541698565713481 | 0.63 |
| 0.4520757917996021 | 0.63 |
| 0.45103333789326605 | 0.63 |
| 0.4524292434674988 | 0.632 |
| 0.45258422929079906 | 0.633 |
| 0.45258422929079906 | 0.634 |
| 0.45374271726096926 | 0.636 |
| 0.4544359596409438 | 0.637 |
| 0.452894128894192 | 0.637 |
| 0.4526957613173507 | 0.638 |
| 0.45258422929079906 | 0.639 |
| 0.45273919109721605 | 0.64 |
| 0.4528135681347291 | 0.641 |
| 0.4558271268448309 | 0.644 |
| 0.45517194876998995 | 0.645 |
| 0.4525408415316588 | 0.644 |
| 0.4539346458232355 | 0.646 |
| 0.4542812605662237 | 0.647 |
| 0.4542812605662237 | 0.648 |
| 0.45424412728023156 | 0.649 |
| 0.4541698565713481 | 0.65 |
| 0.4532782262549012 | 0.65 |
| 0.4526957613173507 | 0.651 |
| 0.4526214242642951 | 0.652 |
| 0.45296849440921183 | 0.653 |
| 0.452658569108768 | 0.654 |
| 0.45517194876998995 | 0.657 |
| 0.45602482571132996 | 0.658 |
| 0.45432457287978983 | 0.658 |
| 0.4551348485440658 | 0.66 |
| 0.45609895878314255 | 0.661 |
| 0.45844961301532333 | 0.664 |
| 0.4600629421066063 | 0.666 |
| 0.46332464050992506 | 0.669 |
| 0.4630976999105922 | 0.67 |
| 0.4615261286218056 | 0.67 |
| 0.4632142394973069 | 0.672 |
| 0.4639009008566835 | 0.673 |
| 0.4637109239939056 | 0.674 |
| 0.4639376772873432 | 0.675 |
| 0.46363118176856166 | 0.676 |
| 0.4640908898266168 | 0.677 |
| 0.4637109239939056 | 0.678 |
| 0.4637844412703902 | 0.679 |
| 0.4640173468817209 | 0.68 |
| 0.46359439406415587 | 0.681 |
| 0.4653156976743057 | 0.683 |
| 0.46577463217621085 | 0.684 |
| 0.4621034743002163 | 0.683 |
| 0.46164289980170947 | 0.684 |
| 0.4615261286218056 | 0.685 |
| 0.4615629924902833 | 0.686 |
| 0.46175342611430636 | 0.687 |
| 0.4634778987746575 | 0.689 |
| 0.46294433511490324 | 0.69 |
| 0.45975520811110615 | 0.688 |
| 0.4612926903271576 | 0.69 |
| 0.46179646430636107 | 0.692 |
| 0.4636741392229702 | 0.694 |
| 0.4640541190302395 | 0.695 |
| 0.46359439406415587 | 0.696 |
| 0.4638641230734682 | 0.697 |
| 0.4636741392229702 | 0.698 |
| 0.46363118176856166 | 0.699 |
| 0.4642869618478856 | 0.7 |
| 0.4656583906122538 | 0.702 |
| 0.46600707477567327 | 0.704 |
| 0.46577463217621085 | 0.704 |
| 0.4638641230734682 | 0.704 |
| 0.46417054721603473 | 0.705 |
| 0.4636741392229702 | 0.706 |
| 0.4639376772873432 | 0.707 |
| 0.4639009008566835 | 0.708 |
| 0.4655849628599082 | 0.71 |
| 0.46543197907793615 | 0.711 |
| 0.4637476592037213 | 0.711 |
| 0.4651259894256232 | 0.713 |
| 0.46592756355080384 | 0.714 |
| 0.4659642655248858 | 0.715 |
| 0.46657573481476994 | 0.716 |
| 0.46745554430220504 | 0.718 |
| 0.46535242211153266 | 0.718 |
| 0.46382734393759784 | 0.717 |
| 0.46546869924512035 | 0.719 |
| 0.4658541555612876 | 0.721 |
| 0.4657012129590395 | 0.722 |
| 0.46696076473528403 | 0.723 |
| 0.4673394979773041 | 0.725 |
| 0.4622139980037885 | 0.722 |
| 0.4624840995527503 | 0.723 |
| 0.4656583906122538 | 0.726 |
| 0.46589086022963727 | 0.727 |
| 0.46600707477567327 | 0.728 |
| 0.4705410537939517 | 0.733 |
| 0.47020007821450843 | 0.733 |
| 0.46753493413304326 | 0.732 |
| 0.4688653724483078 | 0.734 |
| 0.4693592107835209 | 0.735 |
| 0.4706932580229235 | 0.737 |
| 0.4717945280779957 | 0.739 |
| 0.47293705250517665 | 0.741 |
| 0.4707297855059208 | 0.74 |
| 0.46932263320163886 | 0.74 |
| 0.4708454390892931 | 0.742 |
| 0.47122275205596775 | 0.743 |
| 0.4708819610140238 | 0.744 |
| 0.4709975970001097 | 0.745 |
| 0.4709184816049519 | 0.746 |
| 0.47111321961606045 | 0.747 |
| 0.4711862425756886 | 0.748 |
| 0.4709184816049519 | 0.749 |
| 0.47248144187657987 | 0.751 |
| 0.4731617713550213 | 0.753 |
| 0.47441191929099513 | 0.755 |
| 0.4743755260622018 | 0.756 |
| 0.47293705250517665 | 0.756 |
| 0.473277144028463 | 0.757 |
| 0.47304638536918986 | 0.758 |
| 0.47304638536918986 | 0.759 |
| 0.4731253326000277 | 0.76 |
| 0.47285809040816035 | 0.761 |
| 0.4733500091485209 | 0.762 |
| 0.47293705250517665 | 0.763 |
| 0.4711497317624186 | 0.762 |
| 0.47149043157824805 | 0.764 |
| 0.47080891583066287 | 0.764 |
| 0.4731617713550213 | 0.767 |
| 0.4747151288075158 | 0.769 |
| 0.4734289324136866 | 0.769 |
| 0.4734653601077615 | 0.77 |
| 0.47464236309281926 | 0.772 |
| 0.4758119333849204 | 0.774 |
| 0.4765324101877331 | 0.776 |
| 0.47649609405008697 | 0.777 |
| 0.47638109217975183 | 0.778 |
| 0.47464236309281926 | 0.777 |
| 0.47600572087485116 | 0.779 |
| 0.4765324101877331 | 0.781 |
| 0.47641741249398617 | 0.782 |
| 0.4768349775295959 | 0.783 |
| 0.4763447705463045 | 0.784 |
| 0.4759270007244451 | 0.785 |
| 0.47475150967939195 | 0.785 |
| 0.4774760720413088 | 0.788 |
| 0.4781953512986352 | 0.789 |
| 0.47789319534375485 | 0.79 |
| 0.47789319534375485 | 0.791 |
| 0.47789319534375485 | 0.792 |
| 0.47675632263390544 | 0.792 |
| 0.4770225252199264 | 0.794 |
| 0.4778146236413201 | 0.795 |
| 0.47826785894570545 | 0.797 |
| 0.4779294607804234 | 0.797 |
| 0.47808054469133177 | 0.799 |
| 0.4778146236413201 | 0.799 |
| 0.4764537314891029 | 0.799 |
| 0.4772523207160278 | 0.801 |
| 0.4779294607804234 | 0.803 |
| 0.4795539244167628 | 0.805 |
| 0.48068160325339904 | 0.807 |
| 0.48331193734177297 | 0.81 |
| 0.48354033952251296 | 0.811 |
| 0.48331193734177297 | 0.812 |
| 0.4833900783128043 | 0.813 |
| 0.4833900783128043 | 0.814 |
| 0.4832758665820955 | 0.815 |
| 0.4844053556796394 | 0.817 |
| 0.48477758779190283 | 0.819 |
| 0.4836124134050321 | 0.819 |
| 0.48357640074388397 | 0.82 |
| 0.48477758779190283 | 0.822 |
| 0.4851136768684407 | 0.823 |
| 0.4849636519021455 | 0.824 |
| 0.4865766909047641 | 0.827 |
| 0.48684029242051724 | 0.828 |
| 0.48492764067296257 | 0.828 |
| 0.4871397574175676 | 0.831 |
| 0.4885220775109601 | 0.833 |
| 0.4886715696131155 | 0.834 |
| 0.4890421703758547 | 0.835 |
| 0.4900876025102006 | 0.837 |
| 0.48874332164639495 | 0.837 |
| 0.4869121759673182 | 0.837 |
| 0.48837256305757465 | 0.839 |
| 0.48874332164639495 | 0.84 |
| 0.48848022136094754 | 0.841 |
| 0.48784614510029184 | 0.842 |
| 0.4867983658167526 | 0.842 |
| 0.48402698546266154 | 0.841 |
| 0.48354033952251296 | 0.842 |
| 0.48331193734177297 | 0.843 |
| 0.4834261449530874 | 0.844 |
| 0.4833900783128043 | 0.845 |
| 0.48474156986157846 | 0.847 |
| 0.4849996618345665 | 0.848 |
| 0.48484961976091145 | 0.849 |
| 0.4851136768684407 | 0.85 |
| 0.48489162814692405 | 0.851 |
| 0.48661264279962463 | 0.853 |
| 0.4873253825722584 | 0.855 |
| 0.48848022136094754 | 0.857 |
| 0.48784614510029184 | 0.857 |
| 0.4869121759673182 | 0.857 |
| 0.4881452620300205 | 0.859 |
| 0.48874332164639495 | 0.861 |
| 0.4869481158030949 | 0.86 |
| 0.4876246552881295 | 0.862 |
| 0.48870744627329943 | 0.863 |
| 0.48874332164639495 | 0.864 |
| 0.48885691066892784 | 0.865 |
| 0.4900876025102006 | 0.867 |
| 0.49143012560050775 | 0.869 |
| 0.4922108511692983 | 0.87 |
| 0.4922108511692983 | 0.869 |
| 0.4918414230801222 | 0.866 |
| 0.4885220775109601 | 0.859 |